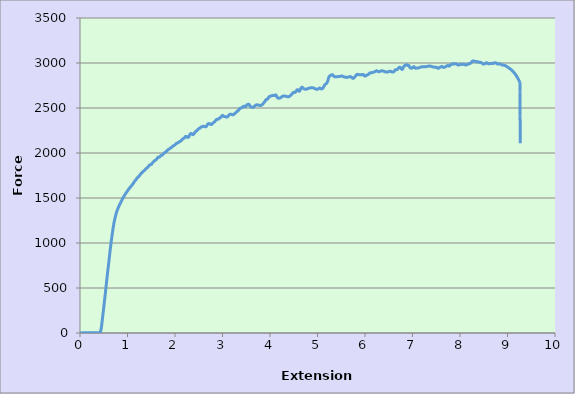
| Category | Series 0 |
|---|---|
| 0.0 | 1.5 |
| 0.0 | 1.5 |
| 0.0 | 1.5 |
| 0.0002 | 1.5 |
| 0.002 | 1.5 |
| 0.0034 | 1.5 |
| 0.0064 | 1.5 |
| 0.0079 | 1.5 |
| 0.0112 | 1.5 |
| 0.0143 | 1.5 |
| 0.0157 | 1.5 |
| 0.0189 | 1 |
| 0.022 | 1 |
| 0.0237 | 1 |
| 0.0268 | 1 |
| 0.03 | 1 |
| 0.0315 | 1 |
| 0.0348 | 1 |
| 0.0365 | 1 |
| 0.0396 | 1 |
| 0.0426 | 1 |
| 0.0442 | 1 |
| 0.0475 | 1 |
| 0.0508 | 1.5 |
| 0.0523 | 1.5 |
| 0.0555 | 1.5 |
| 0.0585 | 1.5 |
| 0.0601 | 1.5 |
| 0.0633 | 1.5 |
| 0.0665 | 1.5 |
| 0.0681 | 1.5 |
| 0.0712 | 1.5 |
| 0.0728 | 1.5 |
| 0.076 | 1.5 |
| 0.0792 | 1.5 |
| 0.0807 | 1.5 |
| 0.0839 | 1.5 |
| 0.0869 | 1.5 |
| 0.0886 | 2 |
| 0.0919 | 2 |
| 0.0951 | 2 |
| 0.0966 | 2 |
| 0.0997 | 2 |
| 0.1013 | 2 |
| 0.1044 | 2 |
| 0.1077 | 2 |
| 0.1094 | 2 |
| 0.1126 | 2 |
| 0.1156 | 2 |
| 0.1171 | 2 |
| 0.1203 | 2 |
| 0.1236 | 2 |
| 0.1253 | 2 |
| 0.1284 | 2 |
| 0.1315 | 2 |
| 0.1331 | 2 |
| 0.1362 | 2 |
| 0.1379 | 2 |
| 0.1411 | 2 |
| 0.1442 | 2 |
| 0.1457 | 2 |
| 0.1489 | 2 |
| 0.1521 | 2 |
| 0.1538 | 2 |
| 0.1568 | 2 |
| 0.1599 | 2 |
| 0.1614 | 2 |
| 0.1647 | 2 |
| 0.1665 | 2 |
| 0.1697 | 2 |
| 0.1727 | 2 |
| 0.1743 | 2 |
| 0.1775 | 2 |
| 0.1807 | 2 |
| 0.1823 | 2 |
| 0.1855 | 2 |
| 0.1885 | 2 |
| 0.1902 | 2.5 |
| 0.1934 | 2.5 |
| 0.1965 | 2.5 |
| 0.198 | 2.5 |
| 0.2011 | 2.5 |
| 0.2028 | 2.5 |
| 0.206 | 2.5 |
| 0.2093 | 2.5 |
| 0.2108 | 2.5 |
| 0.2139 | 2.5 |
| 0.2171 | 2.5 |
| 0.2186 | 2.5 |
| 0.2219 | 2.5 |
| 0.2251 | 2.5 |
| 0.2268 | 2.5 |
| 0.23 | 2.5 |
| 0.2314 | 2.5 |
| 0.2345 | 2.5 |
| 0.2377 | 2.5 |
| 0.2394 | 2.5 |
| 0.2426 | 2.5 |
| 0.2457 | 2.5 |
| 0.2472 | 2.5 |
| 0.2504 | 2.5 |
| 0.2536 | 2.5 |
| 0.2552 | 2.5 |
| 0.2583 | 2.5 |
| 0.2598 | 2.5 |
| 0.2632 | 2.5 |
| 0.2664 | 2.5 |
| 0.268 | 2.5 |
| 0.2711 | 2.5 |
| 0.2742 | 2.5 |
| 0.2758 | 2.5 |
| 0.279 | 2.5 |
| 0.2822 | 2.5 |
| 0.2838 | 2.5 |
| 0.2869 | 2.5 |
| 0.2885 | 2.5 |
| 0.2918 | 2.5 |
| 0.295 | 2.5 |
| 0.2965 | 2.5 |
| 0.2998 | 2.5 |
| 0.3029 | 2.5 |
| 0.3045 | 2.5 |
| 0.3077 | 2.5 |
| 0.3109 | 2.5 |
| 0.3124 | 2.5 |
| 0.3156 | 2.5 |
| 0.3172 | 2.5 |
| 0.3203 | 2.5 |
| 0.3236 | 2.5 |
| 0.3253 | 2.5 |
| 0.3284 | 2.5 |
| 0.3315 | 2.5 |
| 0.3329 | 2.5 |
| 0.3361 | 2.5 |
| 0.3394 | 2.5 |
| 0.3411 | 2.5 |
| 0.3443 | 2.5 |
| 0.3457 | 2.5 |
| 0.349 | 2.5 |
| 0.3522 | 2.5 |
| 0.3537 | 2.5 |
| 0.357 | 2.5 |
| 0.3601 | 2.5 |
| 0.3617 | 2.5 |
| 0.3649 | 2.9 |
| 0.368 | 2.9 |
| 0.3695 | 2.9 |
| 0.3727 | 2.9 |
| 0.3758 | 2.9 |
| 0.3775 | 2.9 |
| 0.3807 | 2.9 |
| 0.3823 | 2.9 |
| 0.3855 | 2.9 |
| 0.3885 | 2.9 |
| 0.3901 | 2.9 |
| 0.3933 | 2.9 |
| 0.3966 | 2.9 |
| 0.3981 | 2.9 |
| 0.4014 | 2.9 |
| 0.4044 | 3.4 |
| 0.406 | 3.4 |
| 0.4091 | 3.9 |
| 0.4107 | 3.9 |
| 0.4141 | 4.9 |
| 0.4172 | 5.9 |
| 0.4187 | 6.4 |
| 0.4218 | 8.3 |
| 0.4251 | 10.8 |
| 0.4274 | 12.8 |
| 0.4291 | 14.7 |
| 0.4322 | 19.1 |
| 0.4347 | 21.6 |
| 0.4379 | 28.9 |
| 0.4394 | 33.4 |
| 0.4425 | 37.8 |
| 0.4456 | 47.6 |
| 0.4472 | 53 |
| 0.4503 | 64.7 |
| 0.4528 | 71.6 |
| 0.4561 | 85.8 |
| 0.4576 | 92.7 |
| 0.4609 | 107.9 |
| 0.4639 | 122.6 |
| 0.4662 | 131 |
| 0.468 | 138.8 |
| 0.4712 | 154.5 |
| 0.4744 | 169.7 |
| 0.476 | 177.6 |
| 0.479 | 192.3 |
| 0.4824 | 207 |
| 0.4839 | 214.3 |
| 0.4871 | 228.1 |
| 0.4896 | 235.4 |
| 0.4927 | 250.2 |
| 0.4942 | 257.5 |
| 0.4974 | 273.2 |
| 0.5006 | 287.4 |
| 0.5023 | 293.8 |
| 0.5053 | 308.5 |
| 0.5084 | 322.7 |
| 0.51 | 330.6 |
| 0.5133 | 345.8 |
| 0.515 | 353.7 |
| 0.5181 | 369.3 |
| 0.5211 | 384.1 |
| 0.5226 | 391.9 |
| 0.5258 | 407.1 |
| 0.5284 | 414.5 |
| 0.5316 | 430.2 |
| 0.5331 | 438 |
| 0.5361 | 454.2 |
| 0.5393 | 470.4 |
| 0.541 | 478.2 |
| 0.5442 | 494.4 |
| 0.5473 | 510.1 |
| 0.549 | 517.5 |
| 0.5521 | 532.7 |
| 0.5554 | 547.9 |
| 0.5569 | 555.7 |
| 0.5601 | 570.9 |
| 0.5617 | 578.3 |
| 0.5648 | 593 |
| 0.568 | 608.2 |
| 0.5695 | 616.6 |
| 0.5728 | 631.3 |
| 0.576 | 646.5 |
| 0.5776 | 653.8 |
| 0.5807 | 669 |
| 0.5838 | 683.8 |
| 0.5853 | 691.1 |
| 0.5885 | 705.8 |
| 0.591 | 713.7 |
| 0.5941 | 729.9 |
| 0.5958 | 737.7 |
| 0.599 | 752.4 |
| 0.6005 | 760.3 |
| 0.6039 | 775 |
| 0.6069 | 789.7 |
| 0.6084 | 796.6 |
| 0.6117 | 812.3 |
| 0.6149 | 827.5 |
| 0.6166 | 835.3 |
| 0.6197 | 850.5 |
| 0.6227 | 865.7 |
| 0.6243 | 872.6 |
| 0.6275 | 886.8 |
| 0.6308 | 902 |
| 0.6324 | 908.4 |
| 0.6355 | 922.6 |
| 0.637 | 930 |
| 0.6401 | 943.7 |
| 0.6434 | 957.5 |
| 0.6451 | 963.8 |
| 0.6482 | 977.1 |
| 0.6513 | 990.8 |
| 0.6528 | 997.7 |
| 0.6561 | 1010.9 |
| 0.6592 | 1023.7 |
| 0.6609 | 1029.6 |
| 0.664 | 1042.8 |
| 0.6655 | 1048.7 |
| 0.6689 | 1061 |
| 0.6721 | 1073.7 |
| 0.6736 | 1080.1 |
| 0.6767 | 1091.9 |
| 0.6797 | 1104.1 |
| 0.6814 | 1109.5 |
| 0.6847 | 1120.8 |
| 0.688 | 1132.6 |
| 0.6894 | 1138.5 |
| 0.6926 | 1149.2 |
| 0.6941 | 1155.1 |
| 0.6973 | 1166.4 |
| 0.7005 | 1176.7 |
| 0.7023 | 1181.6 |
| 0.7055 | 1191.9 |
| 0.7085 | 1201.7 |
| 0.71 | 1207.1 |
| 0.7132 | 1216.4 |
| 0.7164 | 1225.8 |
| 0.718 | 1230.2 |
| 0.7212 | 1238.5 |
| 0.7226 | 1243.4 |
| 0.726 | 1251.8 |
| 0.7292 | 1259.6 |
| 0.7308 | 1263.5 |
| 0.7339 | 1267.5 |
| 0.7369 | 1275.8 |
| 0.7386 | 1279.2 |
| 0.7418 | 1287.1 |
| 0.7451 | 1293.9 |
| 0.7466 | 1297.4 |
| 0.7498 | 1304.2 |
| 0.7528 | 1310.6 |
| 0.7545 | 1314 |
| 0.7576 | 1319.9 |
| 0.7592 | 1323.4 |
| 0.7624 | 1328.8 |
| 0.7655 | 1334.2 |
| 0.7672 | 1337.1 |
| 0.7703 | 1342.5 |
| 0.7736 | 1347.4 |
| 0.7751 | 1349.9 |
| 0.7782 | 1354.8 |
| 0.7813 | 1359.2 |
| 0.783 | 1361.6 |
| 0.7863 | 1366 |
| 0.788 | 1368.5 |
| 0.7912 | 1372.4 |
| 0.7942 | 1377.3 |
| 0.7956 | 1379.3 |
| 0.7988 | 1383.2 |
| 0.802 | 1387.1 |
| 0.8037 | 1389.6 |
| 0.8069 | 1393.5 |
| 0.81 | 1397.4 |
| 0.8114 | 1398.9 |
| 0.8146 | 1402.8 |
| 0.8163 | 1404.8 |
| 0.8196 | 1408.7 |
| 0.8227 | 1412.6 |
| 0.8243 | 1414.1 |
| 0.8275 | 1418 |
| 0.8308 | 1422 |
| 0.8323 | 1423.9 |
| 0.8355 | 1427.4 |
| 0.8387 | 1430.8 |
| 0.8402 | 1432.8 |
| 0.8434 | 1436.7 |
| 0.8451 | 1438.1 |
| 0.8483 | 1441.6 |
| 0.8514 | 1445 |
| 0.853 | 1447 |
| 0.8561 | 1450.4 |
| 0.8594 | 1453.8 |
| 0.861 | 1455.8 |
| 0.8641 | 1459.2 |
| 0.8672 | 1462.2 |
| 0.8688 | 1464.1 |
| 0.872 | 1467.1 |
| 0.8735 | 1469 |
| 0.8769 | 1472 |
| 0.8801 | 1475.4 |
| 0.8816 | 1476.9 |
| 0.8847 | 1480.3 |
| 0.8878 | 1483.3 |
| 0.8895 | 1484.7 |
| 0.8927 | 1488.2 |
| 0.8958 | 1491.1 |
| 0.8973 | 1493.1 |
| 0.9005 | 1496 |
| 0.9022 | 1497.5 |
| 0.9055 | 1500.4 |
| 0.9086 | 1503.4 |
| 0.9101 | 1505.3 |
| 0.9133 | 1508.3 |
| 0.9166 | 1511.2 |
| 0.9181 | 1512.7 |
| 0.9214 | 1515.2 |
| 0.9245 | 1518.1 |
| 0.926 | 1519.6 |
| 0.9291 | 1522.5 |
| 0.9307 | 1524 |
| 0.934 | 1526.9 |
| 0.9372 | 1529.4 |
| 0.9387 | 1530.9 |
| 0.9418 | 1533.3 |
| 0.945 | 1535.8 |
| 0.9467 | 1537.2 |
| 0.9499 | 1540.2 |
| 0.953 | 1542.6 |
| 0.9544 | 1543.6 |
| 0.9576 | 1546.5 |
| 0.9594 | 1547.5 |
| 0.9626 | 1550.5 |
| 0.9658 | 1552.9 |
| 0.9674 | 1554.4 |
| 0.9704 | 1556.8 |
| 0.9736 | 1559.3 |
| 0.9754 | 1560.3 |
| 0.9786 | 1562.7 |
| 0.9817 | 1565.2 |
| 0.9832 | 1566.7 |
| 0.9863 | 1568.6 |
| 0.988 | 1570.1 |
| 0.9912 | 1572.5 |
| 0.9944 | 1574.5 |
| 0.9961 | 1576 |
| 0.9992 | 1578.4 |
| 1.0024 | 1580.9 |
| 1.0039 | 1582.4 |
| 1.0071 | 1584.8 |
| 1.0102 | 1586.8 |
| 1.0118 | 1588.2 |
| 1.015 | 1590.7 |
| 1.0165 | 1591.7 |
| 1.0199 | 1594.1 |
| 1.0231 | 1596.6 |
| 1.0245 | 1598 |
| 1.0275 | 1600 |
| 1.0308 | 1602.5 |
| 1.0325 | 1603.4 |
| 1.0358 | 1605.9 |
| 1.039 | 1607.9 |
| 1.0404 | 1608.8 |
| 1.0435 | 1610.8 |
| 1.0451 | 1611.8 |
| 1.0484 | 1613.7 |
| 1.0516 | 1615.7 |
| 1.0533 | 1616.7 |
| 1.0564 | 1618.6 |
| 1.0595 | 1620.6 |
| 1.061 | 1621.6 |
| 1.0642 | 1623.6 |
| 1.0674 | 1626 |
| 1.069 | 1627 |
| 1.0722 | 1629 |
| 1.0737 | 1629.9 |
| 1.0771 | 1632.4 |
| 1.0803 | 1634.3 |
| 1.0817 | 1635.3 |
| 1.0848 | 1637.3 |
| 1.088 | 1639.7 |
| 1.0897 | 1640.7 |
| 1.093 | 1642.7 |
| 1.0962 | 1644.6 |
| 1.0978 | 1645.6 |
| 1.1008 | 1647.6 |
| 1.1023 | 1648.6 |
| 1.1055 | 1651 |
| 1.1089 | 1653 |
| 1.1105 | 1654 |
| 1.1135 | 1656.4 |
| 1.1167 | 1658.9 |
| 1.1184 | 1659.9 |
| 1.1216 | 1662.3 |
| 1.1247 | 1665.2 |
| 1.1262 | 1666.2 |
| 1.1293 | 1669.2 |
| 1.131 | 1670.6 |
| 1.1343 | 1673.1 |
| 1.1375 | 1676 |
| 1.1391 | 1677.5 |
| 1.1422 | 1680 |
| 1.1453 | 1682.4 |
| 1.1468 | 1683.4 |
| 1.1501 | 1685.8 |
| 1.1533 | 1687.8 |
| 1.1549 | 1688.8 |
| 1.1579 | 1690.8 |
| 1.1594 | 1692.2 |
| 1.1628 | 1694.2 |
| 1.1661 | 1696.1 |
| 1.1678 | 1697.1 |
| 1.1709 | 1699.1 |
| 1.174 | 1701.5 |
| 1.1756 | 1702.5 |
| 1.1787 | 1704.5 |
| 1.1819 | 1706.9 |
| 1.1836 | 1707.9 |
| 1.1867 | 1709.9 |
| 1.1882 | 1710.9 |
| 1.1914 | 1713.3 |
| 1.1946 | 1715.3 |
| 1.1962 | 1716.8 |
| 1.1993 | 1718.7 |
| 1.2024 | 1721.2 |
| 1.204 | 1722.1 |
| 1.2073 | 1724.1 |
| 1.2105 | 1726.1 |
| 1.2121 | 1727.1 |
| 1.2151 | 1729 |
| 1.2166 | 1730 |
| 1.22 | 1732 |
| 1.2232 | 1733.4 |
| 1.2248 | 1733.9 |
| 1.228 | 1735.4 |
| 1.231 | 1736.9 |
| 1.2327 | 1737.8 |
| 1.2358 | 1739.3 |
| 1.239 | 1740.8 |
| 1.2407 | 1741.8 |
| 1.2438 | 1743.2 |
| 1.2453 | 1744.2 |
| 1.2487 | 1746.2 |
| 1.252 | 1748.6 |
| 1.2535 | 1749.6 |
| 1.2565 | 1752.1 |
| 1.2596 | 1754.5 |
| 1.2613 | 1755.5 |
| 1.2646 | 1757 |
| 1.2678 | 1759.4 |
| 1.2693 | 1760.9 |
| 1.2724 | 1763.3 |
| 1.274 | 1764.8 |
| 1.2771 | 1766.8 |
| 1.2803 | 1769.2 |
| 1.282 | 1770.2 |
| 1.2852 | 1772.2 |
| 1.2883 | 1773.6 |
| 1.2898 | 1774.6 |
| 1.293 | 1775.6 |
| 1.2962 | 1777.1 |
| 1.2979 | 1777.6 |
| 1.301 | 1779 |
| 1.3042 | 1780.5 |
| 1.3059 | 1781 |
| 1.3091 | 1783 |
| 1.3107 | 1783.5 |
| 1.3137 | 1785.4 |
| 1.3168 | 1787.4 |
| 1.3184 | 1788.4 |
| 1.3217 | 1790.8 |
| 1.3249 | 1792.8 |
| 1.3265 | 1793.8 |
| 1.3295 | 1795.7 |
| 1.3326 | 1797.7 |
| 1.3343 | 1798.2 |
| 1.3375 | 1799.6 |
| 1.3391 | 1800.1 |
| 1.3423 | 1801.1 |
| 1.3453 | 1802.1 |
| 1.347 | 1802.6 |
| 1.3502 | 1803.6 |
| 1.3534 | 1804.5 |
| 1.3549 | 1805 |
| 1.3581 | 1806.5 |
| 1.3611 | 1808.5 |
| 1.3628 | 1809 |
| 1.3661 | 1810.9 |
| 1.3676 | 1811.9 |
| 1.3709 | 1813.9 |
| 1.3739 | 1815.8 |
| 1.3754 | 1816.8 |
| 1.3786 | 1818.8 |
| 1.3819 | 1820.7 |
| 1.3836 | 1821.7 |
| 1.3868 | 1823.2 |
| 1.3898 | 1825.2 |
| 1.3913 | 1825.6 |
| 1.3945 | 1827.1 |
| 1.3962 | 1828.1 |
| 1.3995 | 1829.6 |
| 1.4026 | 1831 |
| 1.4042 | 1831.5 |
| 1.4074 | 1833 |
| 1.4105 | 1834.5 |
| 1.412 | 1835.5 |
| 1.4152 | 1836.9 |
| 1.4183 | 1838.4 |
| 1.42 | 1838.9 |
| 1.4232 | 1840.4 |
| 1.4265 | 1842.3 |
| 1.4281 | 1842.8 |
| 1.4311 | 1844.8 |
| 1.4326 | 1845.8 |
| 1.4358 | 1847.7 |
| 1.4391 | 1849.7 |
| 1.4408 | 1851.1 |
| 1.444 | 1853.6 |
| 1.447 | 1856.1 |
| 1.4485 | 1857 |
| 1.4516 | 1859.5 |
| 1.4549 | 1861.9 |
| 1.4566 | 1862.9 |
| 1.4597 | 1864.4 |
| 1.4611 | 1865.4 |
| 1.4644 | 1866.8 |
| 1.4676 | 1867.8 |
| 1.4692 | 1867.8 |
| 1.4724 | 1868.8 |
| 1.4755 | 1869.3 |
| 1.477 | 1869.3 |
| 1.4802 | 1869.3 |
| 1.4835 | 1869.3 |
| 1.4852 | 1869.3 |
| 1.4882 | 1869.8 |
| 1.4897 | 1869.8 |
| 1.493 | 1870.3 |
| 1.4962 | 1871.3 |
| 1.4977 | 1871.7 |
| 1.5009 | 1872.7 |
| 1.5041 | 1874.7 |
| 1.5056 | 1875.2 |
| 1.5087 | 1877.1 |
| 1.512 | 1879.6 |
| 1.5137 | 1880.6 |
| 1.5169 | 1883.5 |
| 1.5183 | 1884.5 |
| 1.5217 | 1887 |
| 1.5249 | 1889.9 |
| 1.5264 | 1890.9 |
| 1.5296 | 1893.3 |
| 1.5327 | 1895.3 |
| 1.5343 | 1896.3 |
| 1.5376 | 1897.7 |
| 1.5408 | 1899.7 |
| 1.5423 | 1900.2 |
| 1.5454 | 1901.7 |
| 1.5469 | 1902.2 |
| 1.5501 | 1903.6 |
| 1.5534 | 1905.1 |
| 1.5551 | 1905.6 |
| 1.5583 | 1907.1 |
| 1.5614 | 1909 |
| 1.5628 | 1909.5 |
| 1.566 | 1911.5 |
| 1.5692 | 1913 |
| 1.5709 | 1913.9 |
| 1.5741 | 1915.4 |
| 1.5756 | 1915.9 |
| 1.5789 | 1917.4 |
| 1.582 | 1918.3 |
| 1.5835 | 1919.3 |
| 1.5867 | 1920.3 |
| 1.5898 | 1921.3 |
| 1.5914 | 1921.8 |
| 1.5947 | 1922.8 |
| 1.5979 | 1923.7 |
| 1.5995 | 1924.2 |
| 1.6027 | 1925.7 |
| 1.6042 | 1926.7 |
| 1.6073 | 1928.2 |
| 1.6106 | 1929.6 |
| 1.6123 | 1930.6 |
| 1.6155 | 1932.6 |
| 1.6186 | 1935 |
| 1.6201 | 1936.5 |
| 1.6232 | 1938.9 |
| 1.6264 | 1941.4 |
| 1.628 | 1942.9 |
| 1.6312 | 1945.3 |
| 1.6329 | 1946.3 |
| 1.636 | 1948.8 |
| 1.6392 | 1950.2 |
| 1.6409 | 1951.2 |
| 1.6441 | 1952.7 |
| 1.6472 | 1953.2 |
| 1.6486 | 1953.7 |
| 1.6518 | 1953.7 |
| 1.6551 | 1953.7 |
| 1.6568 | 1953.7 |
| 1.66 | 1953.7 |
| 1.6614 | 1953.7 |
| 1.6646 | 1953.7 |
| 1.6678 | 1953.7 |
| 1.6694 | 1954.2 |
| 1.6726 | 1955.1 |
| 1.6758 | 1956.1 |
| 1.6774 | 1956.6 |
| 1.6805 | 1958.1 |
| 1.6836 | 1960 |
| 1.6852 | 1961 |
| 1.6884 | 1963 |
| 1.6915 | 1965.4 |
| 1.6932 | 1966.4 |
| 1.6964 | 1968.4 |
| 1.6979 | 1968.9 |
| 1.7011 | 1970.3 |
| 1.7042 | 1971.8 |
| 1.7059 | 1972.3 |
| 1.709 | 1973.3 |
| 1.7123 | 1973.8 |
| 1.7138 | 1974.3 |
| 1.7169 | 1974.8 |
| 1.72 | 1975.2 |
| 1.7216 | 1975.2 |
| 1.7248 | 1975.7 |
| 1.7264 | 1976.2 |
| 1.7298 | 1976.7 |
| 1.733 | 1977.7 |
| 1.7344 | 1978.2 |
| 1.7375 | 1979.7 |
| 1.7407 | 1981.1 |
| 1.7424 | 1982.1 |
| 1.7456 | 1984.1 |
| 1.7487 | 1986 |
| 1.7504 | 1987 |
| 1.7535 | 1989 |
| 1.755 | 1990 |
| 1.7582 | 1991.9 |
| 1.7614 | 1993.9 |
| 1.763 | 1994.9 |
| 1.7661 | 1996.3 |
| 1.7694 | 1998.3 |
| 1.7709 | 1998.8 |
| 1.7741 | 2000.3 |
| 1.7772 | 2001.7 |
| 1.7788 | 2002.2 |
| 1.7819 | 2003.7 |
| 1.7835 | 2004.2 |
| 1.7869 | 2005.2 |
| 1.7902 | 2006.6 |
| 1.7916 | 2007.1 |
| 1.7947 | 2008.1 |
| 1.7978 | 2009.1 |
| 1.7994 | 2010.1 |
| 1.8027 | 2011 |
| 1.8059 | 2012 |
| 1.8073 | 2013 |
| 1.8107 | 2014 |
| 1.8122 | 2014.5 |
| 1.8156 | 2016 |
| 1.8187 | 2017.4 |
| 1.8202 | 2018.4 |
| 1.8233 | 2019.9 |
| 1.8265 | 2021.8 |
| 1.8283 | 2022.3 |
| 1.8315 | 2024.3 |
| 1.8346 | 2026.3 |
| 1.836 | 2027.2 |
| 1.8391 | 2029.2 |
| 1.8408 | 2030.2 |
| 1.8441 | 2032.1 |
| 1.8473 | 2034.1 |
| 1.8489 | 2034.6 |
| 1.8519 | 2036.1 |
| 1.8551 | 2037.5 |
| 1.8566 | 2038 |
| 1.8599 | 2039.5 |
| 1.8631 | 2040 |
| 1.8647 | 2040.5 |
| 1.8678 | 2041.5 |
| 1.8694 | 2042 |
| 1.8727 | 2042.4 |
| 1.8759 | 2043.4 |
| 1.8774 | 2043.9 |
| 1.8805 | 2044.9 |
| 1.8837 | 2045.9 |
| 1.8854 | 2046.9 |
| 1.8886 | 2047.8 |
| 1.8917 | 2049.3 |
| 1.8932 | 2050.3 |
| 1.8962 | 2051.8 |
| 1.898 | 2052.3 |
| 1.9012 | 2053.7 |
| 1.9045 | 2055.2 |
| 1.9061 | 2055.7 |
| 1.9092 | 2057.2 |
| 1.9123 | 2058.1 |
| 1.9138 | 2058.6 |
| 1.917 | 2060.1 |
| 1.9203 | 2061.1 |
| 1.9219 | 2061.1 |
| 1.925 | 2062.6 |
| 1.9265 | 2063 |
| 1.9298 | 2064 |
| 1.933 | 2065.5 |
| 1.9345 | 2066 |
| 1.9376 | 2067.5 |
| 1.9408 | 2068.9 |
| 1.9425 | 2069.4 |
| 1.9458 | 2071.4 |
| 1.949 | 2072.9 |
| 1.9504 | 2073.3 |
| 1.9534 | 2074.8 |
| 1.9551 | 2075.8 |
| 1.9586 | 2077.3 |
| 1.9618 | 2078.2 |
| 1.9633 | 2079.2 |
| 1.9664 | 2080.2 |
| 1.9695 | 2081.2 |
| 1.9711 | 2081.7 |
| 1.9743 | 2082.7 |
| 1.9776 | 2083.6 |
| 1.9791 | 2084.1 |
| 1.9822 | 2085.1 |
| 1.9838 | 2085.6 |
| 1.987 | 2086.6 |
| 1.9902 | 2087.6 |
| 1.9919 | 2088.1 |
| 1.995 | 2089.5 |
| 1.9981 | 2090.5 |
| 1.9997 | 2091.5 |
| 2.003 | 2093 |
| 2.0061 | 2094.4 |
| 2.0077 | 2095.4 |
| 2.0108 | 2097.4 |
| 2.0123 | 2097.9 |
| 2.0157 | 2099.8 |
| 2.0189 | 2101.8 |
| 2.0204 | 2102.8 |
| 2.0235 | 2104.2 |
| 2.0266 | 2105.7 |
| 2.0283 | 2106.2 |
| 2.0315 | 2107.2 |
| 2.0348 | 2108.2 |
| 2.0363 | 2108.7 |
| 2.0393 | 2109.2 |
| 2.041 | 2109.2 |
| 2.0442 | 2109.6 |
| 2.0474 | 2110.1 |
| 2.0491 | 2110.1 |
| 2.0522 | 2110.6 |
| 2.0553 | 2111.1 |
| 2.0568 | 2111.6 |
| 2.0601 | 2112.6 |
| 2.0632 | 2114.1 |
| 2.0649 | 2114.5 |
| 2.0679 | 2116 |
| 2.0694 | 2116.5 |
| 2.0728 | 2118 |
| 2.0761 | 2119.5 |
| 2.0776 | 2119.9 |
| 2.0808 | 2121.4 |
| 2.084 | 2122.4 |
| 2.0855 | 2122.9 |
| 2.0887 | 2123.4 |
| 2.0919 | 2124.4 |
| 2.0936 | 2124.4 |
| 2.0967 | 2125.3 |
| 2.0982 | 2125.3 |
| 2.1014 | 2126.3 |
| 2.1045 | 2127.3 |
| 2.1062 | 2127.8 |
| 2.1093 | 2129.3 |
| 2.1124 | 2130.2 |
| 2.1141 | 2131.2 |
| 2.1174 | 2132.7 |
| 2.1206 | 2134.2 |
| 2.1221 | 2134.7 |
| 2.1251 | 2136.6 |
| 2.1283 | 2138.1 |
| 2.13 | 2138.6 |
| 2.1333 | 2140.1 |
| 2.1348 | 2141 |
| 2.138 | 2142 |
| 2.141 | 2144 |
| 2.1426 | 2144.5 |
| 2.1458 | 2146.4 |
| 2.149 | 2147.9 |
| 2.1506 | 2148.9 |
| 2.1537 | 2150.8 |
| 2.1568 | 2153.3 |
| 2.1585 | 2154.3 |
| 2.1617 | 2156.2 |
| 2.1645 | 2157.2 |
| 2.1661 | 2157.7 |
| 2.1692 | 2159.2 |
| 2.1724 | 2160.7 |
| 2.1741 | 2161.1 |
| 2.1773 | 2161.6 |
| 2.1805 | 2162.1 |
| 2.1819 | 2162.6 |
| 2.185 | 2163.1 |
| 2.1866 | 2163.6 |
| 2.1899 | 2164.6 |
| 2.1931 | 2165.6 |
| 2.1946 | 2166 |
| 2.1978 | 2167.5 |
| 2.2009 | 2169.5 |
| 2.2024 | 2170.5 |
| 2.2057 | 2172.4 |
| 2.2089 | 2174.9 |
| 2.2106 | 2175.9 |
| 2.2137 | 2178.3 |
| 2.2152 | 2179.3 |
| 2.2186 | 2181.3 |
| 2.2217 | 2182.7 |
| 2.2233 | 2183.2 |
| 2.2264 | 2184.2 |
| 2.2295 | 2184.7 |
| 2.2312 | 2184.7 |
| 2.2344 | 2184.2 |
| 2.2376 | 2183.7 |
| 2.2391 | 2183.2 |
| 2.2421 | 2182.7 |
| 2.2437 | 2181.7 |
| 2.247 | 2180.8 |
| 2.2503 | 2179.3 |
| 2.252 | 2178.8 |
| 2.2551 | 2177.3 |
| 2.2581 | 2176.3 |
| 2.2596 | 2175.4 |
| 2.2628 | 2174.4 |
| 2.2661 | 2173.9 |
| 2.2678 | 2173.4 |
| 2.2709 | 2172.9 |
| 2.2723 | 2172.9 |
| 2.2757 | 2172.9 |
| 2.2789 | 2173.9 |
| 2.2803 | 2174.4 |
| 2.2835 | 2175.9 |
| 2.2866 | 2177.8 |
| 2.2883 | 2178.8 |
| 2.2916 | 2181.7 |
| 2.2948 | 2184.7 |
| 2.2963 | 2186.6 |
| 2.2993 | 2190.1 |
| 2.3009 | 2192 |
| 2.3042 | 2196 |
| 2.3075 | 2199.4 |
| 2.3092 | 2201.4 |
| 2.3124 | 2204.3 |
| 2.3154 | 2207.2 |
| 2.317 | 2208.7 |
| 2.3202 | 2211.2 |
| 2.3234 | 2212.6 |
| 2.3249 | 2213.6 |
| 2.328 | 2214.6 |
| 2.3297 | 2215.1 |
| 2.3328 | 2215.6 |
| 2.336 | 2216.1 |
| 2.3377 | 2216.1 |
| 2.3409 | 2215.6 |
| 2.344 | 2215.6 |
| 2.3455 | 2215.1 |
| 2.3487 | 2214.6 |
| 2.352 | 2213.6 |
| 2.3536 | 2213.1 |
| 2.3567 | 2211.7 |
| 2.3581 | 2211.2 |
| 2.3615 | 2209.7 |
| 2.3647 | 2208.2 |
| 2.3662 | 2207.2 |
| 2.3694 | 2205.8 |
| 2.3725 | 2204.8 |
| 2.3741 | 2204.8 |
| 2.3773 | 2203.8 |
| 2.3806 | 2203.8 |
| 2.3821 | 2204.3 |
| 2.3852 | 2204.8 |
| 2.3869 | 2205.8 |
| 2.3901 | 2207.2 |
| 2.3933 | 2209.2 |
| 2.3949 | 2210.7 |
| 2.3981 | 2213.1 |
| 2.4012 | 2215.6 |
| 2.4027 | 2217.1 |
| 2.4059 | 2219.5 |
| 2.4091 | 2222 |
| 2.4108 | 2223.4 |
| 2.4138 | 2225.4 |
| 2.4152 | 2226.9 |
| 2.4186 | 2228.8 |
| 2.4219 | 2230.3 |
| 2.4234 | 2231.3 |
| 2.4266 | 2233.2 |
| 2.4297 | 2234.7 |
| 2.4313 | 2235.7 |
| 2.4345 | 2237.2 |
| 2.4377 | 2238.6 |
| 2.4393 | 2239.6 |
| 2.4425 | 2241.1 |
| 2.444 | 2242.1 |
| 2.4472 | 2243.5 |
| 2.4503 | 2245 |
| 2.452 | 2245.5 |
| 2.4552 | 2247 |
| 2.4583 | 2248 |
| 2.4598 | 2248.9 |
| 2.463 | 2250.4 |
| 2.4664 | 2251.9 |
| 2.468 | 2252.9 |
| 2.471 | 2254.3 |
| 2.4726 | 2255.3 |
| 2.4758 | 2257.3 |
| 2.479 | 2259.2 |
| 2.4808 | 2260.2 |
| 2.484 | 2262.2 |
| 2.4871 | 2264.1 |
| 2.4885 | 2265.1 |
| 2.4916 | 2266.6 |
| 2.4948 | 2268.1 |
| 2.4965 | 2268.6 |
| 2.4997 | 2270 |
| 2.5012 | 2270 |
| 2.5045 | 2271 |
| 2.5077 | 2272 |
| 2.5092 | 2272 |
| 2.5124 | 2273 |
| 2.5155 | 2274 |
| 2.5172 | 2274.4 |
| 2.5204 | 2275.4 |
| 2.5236 | 2276.9 |
| 2.5252 | 2277.4 |
| 2.5283 | 2279.4 |
| 2.5313 | 2280.8 |
| 2.533 | 2281.8 |
| 2.5362 | 2283.8 |
| 2.5377 | 2284.3 |
| 2.5409 | 2285.7 |
| 2.5441 | 2287.2 |
| 2.5456 | 2287.7 |
| 2.5487 | 2288.7 |
| 2.552 | 2289.2 |
| 2.5535 | 2289.2 |
| 2.5568 | 2289.7 |
| 2.5599 | 2290.1 |
| 2.5615 | 2290.1 |
| 2.5647 | 2290.6 |
| 2.5664 | 2290.6 |
| 2.5696 | 2291.1 |
| 2.5727 | 2292.1 |
| 2.5742 | 2292.1 |
| 2.5774 | 2293.1 |
| 2.5806 | 2294.1 |
| 2.5823 | 2294.6 |
| 2.5854 | 2295 |
| 2.5884 | 2296 |
| 2.5899 | 2296 |
| 2.5932 | 2296.5 |
| 2.5965 | 2297 |
| 2.5982 | 2297 |
| 2.6013 | 2297 |
| 2.6027 | 2297 |
| 2.6058 | 2296.5 |
| 2.609 | 2296.5 |
| 2.6107 | 2296 |
| 2.614 | 2295.5 |
| 2.6171 | 2295 |
| 2.6185 | 2294.6 |
| 2.6217 | 2293.6 |
| 2.6249 | 2293.1 |
| 2.6265 | 2292.6 |
| 2.6297 | 2292.1 |
| 2.6311 | 2291.6 |
| 2.6344 | 2291.1 |
| 2.6377 | 2290.6 |
| 2.6393 | 2290.6 |
| 2.6425 | 2290.6 |
| 2.6455 | 2290.6 |
| 2.6471 | 2291.1 |
| 2.6503 | 2291.6 |
| 2.6536 | 2292.6 |
| 2.6551 | 2293.1 |
| 2.6584 | 2295 |
| 2.66 | 2296 |
| 2.663 | 2298 |
| 2.6661 | 2300.4 |
| 2.6678 | 2301.9 |
| 2.6711 | 2304.4 |
| 2.6742 | 2307.3 |
| 2.6757 | 2308.8 |
| 2.6788 | 2311.7 |
| 2.682 | 2314.7 |
| 2.6837 | 2316.1 |
| 2.6869 | 2318.6 |
| 2.6883 | 2319.6 |
| 2.6916 | 2321.5 |
| 2.6949 | 2323 |
| 2.6966 | 2324 |
| 2.6998 | 2325 |
| 2.7029 | 2326 |
| 2.7043 | 2326.4 |
| 2.7074 | 2326.9 |
| 2.7107 | 2327.4 |
| 2.7124 | 2327.4 |
| 2.7156 | 2327.4 |
| 2.7171 | 2327.4 |
| 2.7201 | 2326.9 |
| 2.7233 | 2326.4 |
| 2.725 | 2326.4 |
| 2.7283 | 2325.5 |
| 2.7315 | 2324.5 |
| 2.7329 | 2324 |
| 2.7362 | 2323 |
| 2.7394 | 2321.5 |
| 2.7409 | 2321 |
| 2.7441 | 2320.1 |
| 2.7458 | 2319.1 |
| 2.7489 | 2318.1 |
| 2.752 | 2317.1 |
| 2.7537 | 2316.6 |
| 2.7569 | 2315.7 |
| 2.76 | 2315.7 |
| 2.7615 | 2315.7 |
| 2.7645 | 2315.7 |
| 2.7678 | 2316.6 |
| 2.7695 | 2317.1 |
| 2.7728 | 2318.1 |
| 2.7743 | 2319.1 |
| 2.7775 | 2320.6 |
| 2.7806 | 2322.5 |
| 2.7822 | 2323.5 |
| 2.7854 | 2325 |
| 2.7886 | 2326.9 |
| 2.7903 | 2327.9 |
| 2.7933 | 2329.9 |
| 2.7965 | 2331.8 |
| 2.798 | 2332.3 |
| 2.8012 | 2334.3 |
| 2.8028 | 2334.8 |
| 2.806 | 2336.3 |
| 2.8092 | 2337.7 |
| 2.8109 | 2338.7 |
| 2.8141 | 2339.7 |
| 2.8173 | 2340.7 |
| 2.8187 | 2341.2 |
| 2.8217 | 2342.6 |
| 2.825 | 2343.6 |
| 2.8267 | 2344.1 |
| 2.83 | 2345.1 |
| 2.8315 | 2346.1 |
| 2.8347 | 2347 |
| 2.8378 | 2349 |
| 2.8394 | 2350 |
| 2.8427 | 2351.9 |
| 2.8459 | 2353.9 |
| 2.8474 | 2355.4 |
| 2.8505 | 2357.8 |
| 2.8537 | 2360.3 |
| 2.8554 | 2361.3 |
| 2.8586 | 2363.7 |
| 2.8601 | 2364.7 |
| 2.8633 | 2367.2 |
| 2.8665 | 2369.1 |
| 2.8681 | 2369.6 |
| 2.8713 | 2371.1 |
| 2.8745 | 2372.5 |
| 2.8761 | 2373 |
| 2.8791 | 2373.5 |
| 2.8823 | 2374 |
| 2.8839 | 2374.5 |
| 2.8871 | 2374.5 |
| 2.8887 | 2374.5 |
| 2.8918 | 2375 |
| 2.8949 | 2375 |
| 2.8966 | 2375 |
| 2.8998 | 2375 |
| 2.9031 | 2375.5 |
| 2.9046 | 2375.5 |
| 2.9077 | 2376 |
| 2.9109 | 2376.5 |
| 2.9126 | 2377 |
| 2.9158 | 2377.5 |
| 2.9189 | 2378.4 |
| 2.9204 | 2378.9 |
| 2.9235 | 2380.4 |
| 2.9252 | 2381.4 |
| 2.9284 | 2382.8 |
| 2.9316 | 2384.3 |
| 2.9331 | 2385.3 |
| 2.9361 | 2387.3 |
| 2.9393 | 2388.7 |
| 2.941 | 2389.2 |
| 2.9443 | 2390.7 |
| 2.9475 | 2392.2 |
| 2.949 | 2392.7 |
| 2.952 | 2393.6 |
| 2.9536 | 2394.1 |
| 2.9569 | 2395.1 |
| 2.9601 | 2396.1 |
| 2.9618 | 2396.6 |
| 2.9649 | 2398.1 |
| 2.968 | 2399.5 |
| 2.9695 | 2400 |
| 2.9727 | 2402 |
| 2.9759 | 2404.4 |
| 2.9775 | 2405.4 |
| 2.9806 | 2407.9 |
| 2.9821 | 2408.8 |
| 2.9856 | 2411.3 |
| 2.9888 | 2413.3 |
| 2.9903 | 2414.2 |
| 2.9933 | 2415.7 |
| 2.9965 | 2416.7 |
| 2.9982 | 2416.7 |
| 3.0015 | 2416.7 |
| 3.0047 | 2416.2 |
| 3.0062 | 2415.7 |
| 3.0092 | 2414.7 |
| 3.0108 | 2414.2 |
| 3.014 | 2412.8 |
| 3.0172 | 2411.3 |
| 3.0189 | 2410.8 |
| 3.022 | 2409.3 |
| 3.0251 | 2408.4 |
| 3.0268 | 2407.9 |
| 3.03 | 2406.9 |
| 3.0332 | 2406.4 |
| 3.0347 | 2406.4 |
| 3.0378 | 2405.9 |
| 3.0395 | 2405.9 |
| 3.0427 | 2405.4 |
| 3.046 | 2405.4 |
| 3.0476 | 2404.9 |
| 3.0507 | 2404.9 |
| 3.0537 | 2404.4 |
| 3.0553 | 2404.4 |
| 3.0585 | 2403.5 |
| 3.0618 | 2403 |
| 3.0634 | 2402.5 |
| 3.0665 | 2402 |
| 3.068 | 2401.5 |
| 3.0713 | 2401 |
| 3.0745 | 2400.5 |
| 3.0761 | 2400 |
| 3.0792 | 2399.5 |
| 3.0823 | 2399 |
| 3.084 | 2399 |
| 3.0873 | 2399 |
| 3.0904 | 2399 |
| 3.0919 | 2399 |
| 3.095 | 2399.5 |
| 3.0967 | 2399.5 |
| 3.0999 | 2400.5 |
| 3.1031 | 2401.5 |
| 3.1048 | 2402 |
| 3.1078 | 2403 |
| 3.1109 | 2404.4 |
| 3.1124 | 2405.4 |
| 3.1157 | 2407.4 |
| 3.119 | 2409.3 |
| 3.1206 | 2410.3 |
| 3.1237 | 2412.3 |
| 3.1251 | 2413.8 |
| 3.1285 | 2415.7 |
| 3.1317 | 2418.2 |
| 3.1333 | 2419.1 |
| 3.1365 | 2421.1 |
| 3.1395 | 2423.1 |
| 3.1412 | 2424.1 |
| 3.1443 | 2425.5 |
| 3.1475 | 2427 |
| 3.149 | 2427.5 |
| 3.1522 | 2428.5 |
| 3.1538 | 2429 |
| 3.157 | 2429.4 |
| 3.1602 | 2429.9 |
| 3.1619 | 2429.9 |
| 3.1651 | 2430.4 |
| 3.1681 | 2430.4 |
| 3.1695 | 2430.4 |
| 3.1728 | 2430.4 |
| 3.1761 | 2430.4 |
| 3.1778 | 2430.4 |
| 3.1809 | 2429.9 |
| 3.1825 | 2429.9 |
| 3.1856 | 2429.9 |
| 3.1888 | 2429.4 |
| 3.1903 | 2429.4 |
| 3.1936 | 2429 |
| 3.1968 | 2428.5 |
| 3.1983 | 2428 |
| 3.2015 | 2427.5 |
| 3.2047 | 2427 |
| 3.2064 | 2426.5 |
| 3.2095 | 2426 |
| 3.2126 | 2425.5 |
| 3.2142 | 2425.5 |
| 3.2175 | 2425 |
| 3.2192 | 2425 |
| 3.2223 | 2424.5 |
| 3.2253 | 2424.5 |
| 3.2268 | 2425 |
| 3.23 | 2425.5 |
| 3.2332 | 2426 |
| 3.2349 | 2426.5 |
| 3.2381 | 2427.5 |
| 3.2411 | 2429 |
| 3.2426 | 2429.9 |
| 3.2458 | 2431.4 |
| 3.2475 | 2432.4 |
| 3.2508 | 2433.9 |
| 3.2539 | 2435.8 |
| 3.2555 | 2436.3 |
| 3.2587 | 2438.3 |
| 3.2619 | 2439.7 |
| 3.2634 | 2440.7 |
| 3.2666 | 2442.2 |
| 3.2697 | 2443.7 |
| 3.2714 | 2444.2 |
| 3.2746 | 2445.6 |
| 3.2761 | 2446.1 |
| 3.2794 | 2447.6 |
| 3.2825 | 2449.1 |
| 3.2839 | 2450 |
| 3.2872 | 2451.5 |
| 3.2904 | 2453 |
| 3.2922 | 2453.5 |
| 3.2953 | 2455.4 |
| 3.2983 | 2456.9 |
| 3.2998 | 2457.9 |
| 3.303 | 2459.9 |
| 3.3047 | 2460.8 |
| 3.3079 | 2462.3 |
| 3.3111 | 2464.3 |
| 3.3127 | 2464.8 |
| 3.3158 | 2466.2 |
| 3.319 | 2467.7 |
| 3.3205 | 2468.7 |
| 3.3237 | 2469.7 |
| 3.3268 | 2471.1 |
| 3.3284 | 2471.6 |
| 3.3317 | 2473.1 |
| 3.3332 | 2474.1 |
| 3.3366 | 2476 |
| 3.3397 | 2478 |
| 3.3411 | 2479 |
| 3.3443 | 2481.4 |
| 3.3476 | 2483.4 |
| 3.3493 | 2484.9 |
| 3.3525 | 2487.3 |
| 3.3556 | 2489.3 |
| 3.357 | 2490.3 |
| 3.3602 | 2492.2 |
| 3.3618 | 2493.2 |
| 3.3651 | 2494.7 |
| 3.3682 | 2495.7 |
| 3.3698 | 2496.2 |
| 3.373 | 2496.6 |
| 3.3762 | 2497.6 |
| 3.3779 | 2497.6 |
| 3.381 | 2498.1 |
| 3.3841 | 2498.6 |
| 3.3856 | 2499.1 |
| 3.3889 | 2499.6 |
| 3.3921 | 2500.1 |
| 3.3938 | 2500.6 |
| 3.3969 | 2501.6 |
| 3.3983 | 2502 |
| 3.4014 | 2503 |
| 3.4047 | 2504 |
| 3.4064 | 2504.5 |
| 3.4096 | 2505.5 |
| 3.4127 | 2506.5 |
| 3.4142 | 2507.4 |
| 3.4173 | 2508.4 |
| 3.4205 | 2509.9 |
| 3.4223 | 2510.4 |
| 3.4254 | 2511.4 |
| 3.4269 | 2512.3 |
| 3.43 | 2513.8 |
| 3.4334 | 2515.3 |
| 3.4349 | 2515.8 |
| 3.4381 | 2517.2 |
| 3.4412 | 2518.7 |
| 3.4428 | 2519.2 |
| 3.446 | 2519.7 |
| 3.4492 | 2520.2 |
| 3.4508 | 2520.2 |
| 3.4539 | 2520.2 |
| 3.4555 | 2519.7 |
| 3.4585 | 2519.2 |
| 3.4618 | 2518.2 |
| 3.4635 | 2517.2 |
| 3.4668 | 2515.8 |
| 3.4699 | 2514.8 |
| 3.4714 | 2514.3 |
| 3.4745 | 2513.3 |
| 3.4777 | 2512.8 |
| 3.4794 | 2512.8 |
| 3.4826 | 2513.3 |
| 3.4841 | 2513.8 |
| 3.4874 | 2514.8 |
| 3.4905 | 2516.8 |
| 3.492 | 2517.7 |
| 3.4952 | 2520.7 |
| 3.4984 | 2523.1 |
| 3.5 | 2524.6 |
| 3.5031 | 2527.5 |
| 3.5064 | 2530 |
| 3.5079 | 2531 |
| 3.5111 | 2532.9 |
| 3.5127 | 2533.9 |
| 3.5158 | 2535.4 |
| 3.519 | 2536.4 |
| 3.5207 | 2536.9 |
| 3.524 | 2537.4 |
| 3.5272 | 2537.8 |
| 3.5286 | 2538.3 |
| 3.5316 | 2538.8 |
| 3.5348 | 2539.8 |
| 3.5365 | 2539.8 |
| 3.5397 | 2540.8 |
| 3.5412 | 2541.3 |
| 3.5445 | 2541.8 |
| 3.5477 | 2541.8 |
| 3.5492 | 2541.8 |
| 3.5524 | 2541.8 |
| 3.5556 | 2540.8 |
| 3.5572 | 2539.8 |
| 3.5603 | 2538.3 |
| 3.5636 | 2535.9 |
| 3.5653 | 2534.4 |
| 3.5685 | 2531.5 |
| 3.57 | 2530 |
| 3.5731 | 2526.6 |
| 3.5763 | 2523.6 |
| 3.5778 | 2522.2 |
| 3.5811 | 2519.7 |
| 3.5843 | 2517.2 |
| 3.5859 | 2516.3 |
| 3.5889 | 2514.8 |
| 3.5921 | 2513.3 |
| 3.5936 | 2512.8 |
| 3.5969 | 2512.3 |
| 3.5986 | 2511.9 |
| 3.6017 | 2511.4 |
| 3.6049 | 2510.9 |
| 3.6066 | 2510.9 |
| 3.6098 | 2510.4 |
| 3.6129 | 2509.9 |
| 3.6144 | 2509.4 |
| 3.6175 | 2508.9 |
| 3.6208 | 2508.4 |
| 3.6224 | 2508.4 |
| 3.6256 | 2507.9 |
| 3.6271 | 2507.9 |
| 3.6303 | 2507.4 |
| 3.6335 | 2507.4 |
| 3.635 | 2507.4 |
| 3.6383 | 2507.4 |
| 3.6415 | 2507.9 |
| 3.6431 | 2507.9 |
| 3.6461 | 2508.4 |
| 3.6493 | 2508.9 |
| 3.6508 | 2509.4 |
| 3.6541 | 2509.9 |
| 3.6573 | 2510.9 |
| 3.6589 | 2511.4 |
| 3.662 | 2512.8 |
| 3.6635 | 2513.3 |
| 3.6667 | 2514.8 |
| 3.6698 | 2516.8 |
| 3.6715 | 2517.2 |
| 3.6746 | 2519.2 |
| 3.6778 | 2521.2 |
| 3.6794 | 2522.2 |
| 3.6826 | 2523.6 |
| 3.6858 | 2525.6 |
| 3.6874 | 2526.6 |
| 3.6904 | 2528 |
| 3.692 | 2528.5 |
| 3.6954 | 2530 |
| 3.6987 | 2531.5 |
| 3.7002 | 2532 |
| 3.7032 | 2532.9 |
| 3.7063 | 2533.4 |
| 3.708 | 2533.9 |
| 3.7112 | 2534.4 |
| 3.7144 | 2534.4 |
| 3.7159 | 2534.9 |
| 3.719 | 2534.9 |
| 3.7207 | 2534.9 |
| 3.7239 | 2534.9 |
| 3.727 | 2534.9 |
| 3.7287 | 2534.9 |
| 3.7318 | 2534.9 |
| 3.735 | 2534.9 |
| 3.7366 | 2534.4 |
| 3.7398 | 2534.4 |
| 3.7429 | 2534.4 |
| 3.7446 | 2533.9 |
| 3.7476 | 2533.9 |
| 3.7508 | 2533.4 |
| 3.7524 | 2533.4 |
| 3.7556 | 2532.9 |
| 3.7573 | 2532.9 |
| 3.7603 | 2532.5 |
| 3.7634 | 2532 |
| 3.765 | 2531.5 |
| 3.7684 | 2531 |
| 3.7716 | 2530.5 |
| 3.7731 | 2530 |
| 3.7762 | 2529.5 |
| 3.7794 | 2529 |
| 3.7811 | 2529 |
| 3.7846 | 2529 |
| 3.7863 | 2528.5 |
| 3.7893 | 2528.5 |
| 3.7908 | 2528.5 |
| 3.794 | 2528.5 |
| 3.7974 | 2528.5 |
| 3.7989 | 2528.5 |
| 3.802 | 2529 |
| 3.805 | 2529 |
| 3.8067 | 2529.5 |
| 3.81 | 2530 |
| 3.8133 | 2530.5 |
| 3.8148 | 2531 |
| 3.8179 | 2531.5 |
| 3.8209 | 2532.5 |
| 3.8226 | 2532.9 |
| 3.8259 | 2533.9 |
| 3.8274 | 2534.4 |
| 3.8306 | 2535.4 |
| 3.8337 | 2536.4 |
| 3.8353 | 2536.9 |
| 3.8385 | 2538.3 |
| 3.8417 | 2539.8 |
| 3.8432 | 2540.8 |
| 3.8463 | 2542.8 |
| 3.8494 | 2544.7 |
| 3.8511 | 2545.2 |
| 3.8544 | 2547.7 |
| 3.8559 | 2548.6 |
| 3.8592 | 2550.6 |
| 3.8622 | 2553.1 |
| 3.8637 | 2554 |
| 3.867 | 2556.5 |
| 3.8703 | 2558.4 |
| 3.872 | 2559.4 |
| 3.8751 | 2561.9 |
| 3.8782 | 2563.8 |
| 3.8798 | 2564.8 |
| 3.883 | 2566.8 |
| 3.8845 | 2567.8 |
| 3.8879 | 2569.7 |
| 3.891 | 2571.7 |
| 3.8925 | 2573.2 |
| 3.8957 | 2575.6 |
| 3.8989 | 2578.1 |
| 3.9006 | 2579.5 |
| 3.9037 | 2582.5 |
| 3.9068 | 2585.4 |
| 3.9084 | 2586.9 |
| 3.9118 | 2589.3 |
| 3.9133 | 2590.3 |
| 3.9165 | 2592.3 |
| 3.9195 | 2593.8 |
| 3.9211 | 2594.3 |
| 3.9243 | 2594.7 |
| 3.9276 | 2595.2 |
| 3.9291 | 2595.7 |
| 3.9322 | 2595.7 |
| 3.9353 | 2595.7 |
| 3.9369 | 2595.7 |
| 3.9401 | 2596.2 |
| 3.9417 | 2596.7 |
| 3.9449 | 2597.7 |
| 3.9481 | 2599.2 |
| 3.9497 | 2600.1 |
| 3.9529 | 2602.1 |
| 3.9561 | 2605 |
| 3.9576 | 2606 |
| 3.9609 | 2609 |
| 3.964 | 2611.4 |
| 3.9655 | 2612.9 |
| 3.9687 | 2615.3 |
| 3.9704 | 2616.8 |
| 3.9736 | 2619.3 |
| 3.9767 | 2621.2 |
| 3.9783 | 2622.2 |
| 3.9815 | 2624.2 |
| 3.9848 | 2625.6 |
| 3.9863 | 2626.6 |
| 3.9895 | 2628.1 |
| 3.9925 | 2629.1 |
| 3.9941 | 2629.6 |
| 3.9973 | 2630.1 |
| 3.9989 | 2630.6 |
| 4.0023 | 2631 |
| 4.0054 | 2631.5 |
| 4.0069 | 2631.5 |
| 4.01 | 2632 |
| 4.0132 | 2632 |
| 4.0149 | 2632 |
| 4.018 | 2632.5 |
| 4.0211 | 2633 |
| 4.0226 | 2633.5 |
| 4.0259 | 2634 |
| 4.0276 | 2634 |
| 4.0308 | 2635 |
| 4.0339 | 2635.5 |
| 4.0354 | 2635.9 |
| 4.0386 | 2636.4 |
| 4.0419 | 2637.4 |
| 4.0435 | 2637.9 |
| 4.0467 | 2638.4 |
| 4.0498 | 2639.4 |
| 4.0514 | 2639.4 |
| 4.0545 | 2639.9 |
| 4.0577 | 2640.4 |
| 4.0592 | 2640.4 |
| 4.0624 | 2640.4 |
| 4.064 | 2640.4 |
| 4.0672 | 2639.9 |
| 4.0704 | 2639.9 |
| 4.0719 | 2639.4 |
| 4.075 | 2638.9 |
| 4.0782 | 2638.4 |
| 4.0798 | 2638.4 |
| 4.083 | 2637.9 |
| 4.0863 | 2637.4 |
| 4.0878 | 2637.4 |
| 4.091 | 2637.9 |
| 4.0925 | 2637.9 |
| 4.0956 | 2638.4 |
| 4.0988 | 2639.4 |
| 4.1005 | 2639.9 |
| 4.1037 | 2641.3 |
| 4.1069 | 2642.8 |
| 4.1083 | 2643.3 |
| 4.1115 | 2644.3 |
| 4.1147 | 2645.3 |
| 4.1164 | 2645.8 |
| 4.1196 | 2645.8 |
| 4.1227 | 2644.8 |
| 4.1242 | 2644.3 |
| 4.1274 | 2642.3 |
| 4.1291 | 2641.3 |
| 4.1323 | 2638.9 |
| 4.1354 | 2635.9 |
| 4.1369 | 2634 |
| 4.14 | 2630.6 |
| 4.1433 | 2626.6 |
| 4.1449 | 2625.2 |
| 4.1481 | 2622.2 |
| 4.1511 | 2619.3 |
| 4.1527 | 2617.8 |
| 4.156 | 2615.8 |
| 4.1575 | 2614.9 |
| 4.1608 | 2613.4 |
| 4.164 | 2612.4 |
| 4.1655 | 2611.9 |
| 4.1686 | 2610.9 |
| 4.1718 | 2610.4 |
| 4.1734 | 2610 |
| 4.1766 | 2609.5 |
| 4.1799 | 2609 |
| 4.1814 | 2609 |
| 4.1845 | 2608.5 |
| 4.1862 | 2608.5 |
| 4.1893 | 2608.5 |
| 4.1925 | 2608.5 |
| 4.194 | 2609 |
| 4.1971 | 2609 |
| 4.2004 | 2609.5 |
| 4.2021 | 2609.5 |
| 4.2053 | 2610 |
| 4.2083 | 2610.9 |
| 4.2097 | 2610.9 |
| 4.2129 | 2611.9 |
| 4.2147 | 2612.4 |
| 4.218 | 2613.4 |
| 4.2214 | 2614.4 |
| 4.2228 | 2614.9 |
| 4.2258 | 2615.8 |
| 4.229 | 2616.8 |
| 4.2307 | 2617.8 |
| 4.2339 | 2618.8 |
| 4.237 | 2620.3 |
| 4.2385 | 2620.7 |
| 4.2417 | 2622.2 |
| 4.2434 | 2622.7 |
| 4.2466 | 2624.2 |
| 4.2497 | 2625.2 |
| 4.2514 | 2625.6 |
| 4.2545 | 2626.6 |
| 4.2578 | 2627.6 |
| 4.2593 | 2628.1 |
| 4.2625 | 2629.1 |
| 4.2656 | 2630.1 |
| 4.2671 | 2630.1 |
| 4.2703 | 2631 |
| 4.2735 | 2631.5 |
| 4.2751 | 2631.5 |
| 4.2783 | 2632 |
| 4.2799 | 2632 |
| 4.2829 | 2632.5 |
| 4.2861 | 2632.5 |
| 4.2876 | 2632.5 |
| 4.2909 | 2633 |
| 4.2941 | 2633 |
| 4.2957 | 2633 |
| 4.2989 | 2633 |
| 4.3021 | 2633 |
| 4.3036 | 2633 |
| 4.3067 | 2633 |
| 4.3084 | 2633 |
| 4.3115 | 2633 |
| 4.3147 | 2632.5 |
| 4.3164 | 2632.5 |
| 4.3196 | 2632.5 |
| 4.3227 | 2632 |
| 4.3241 | 2631.5 |
| 4.3273 | 2631 |
| 4.3306 | 2630.6 |
| 4.3323 | 2630.6 |
| 4.3355 | 2630.1 |
| 4.337 | 2629.6 |
| 4.3401 | 2629.1 |
| 4.3433 | 2628.6 |
| 4.3448 | 2628.6 |
| 4.3481 | 2628.1 |
| 4.3513 | 2627.6 |
| 4.3529 | 2627.6 |
| 4.356 | 2627.1 |
| 4.3592 | 2626.6 |
| 4.3607 | 2626.6 |
| 4.3638 | 2626.1 |
| 4.3655 | 2626.1 |
| 4.3686 | 2625.6 |
| 4.3718 | 2625.6 |
| 4.3735 | 2625.6 |
| 4.3768 | 2625.6 |
| 4.3799 | 2625.6 |
| 4.3814 | 2625.6 |
| 4.3844 | 2625.6 |
| 4.3877 | 2625.6 |
| 4.3894 | 2626.1 |
| 4.3927 | 2626.1 |
| 4.3958 | 2626.6 |
| 4.3973 | 2627.1 |
| 4.4003 | 2627.6 |
| 4.402 | 2627.6 |
| 4.4052 | 2628.6 |
| 4.4084 | 2629.6 |
| 4.4099 | 2630.1 |
| 4.4131 | 2631 |
| 4.4164 | 2632 |
| 4.4179 | 2632.5 |
| 4.421 | 2634 |
| 4.4242 | 2635 |
| 4.4258 | 2635.9 |
| 4.429 | 2636.9 |
| 4.4305 | 2637.9 |
| 4.4338 | 2639.4 |
| 4.437 | 2640.9 |
| 4.4386 | 2641.3 |
| 4.4416 | 2642.8 |
| 4.4448 | 2644.3 |
| 4.4463 | 2645.3 |
| 4.4495 | 2647.2 |
| 4.4527 | 2648.7 |
| 4.4544 | 2649.7 |
| 4.4574 | 2651.6 |
| 4.4589 | 2652.6 |
| 4.4624 | 2654.6 |
| 4.4656 | 2657 |
| 4.4671 | 2658 |
| 4.4702 | 2660 |
| 4.4734 | 2662.4 |
| 4.4751 | 2663.4 |
| 4.4783 | 2665.4 |
| 4.4814 | 2667.3 |
| 4.4831 | 2668.3 |
| 4.4861 | 2669.8 |
| 4.4877 | 2670.8 |
| 4.4911 | 2671.8 |
| 4.4942 | 2672.7 |
| 4.4957 | 2673.2 |
| 4.4987 | 2673.7 |
| 4.5019 | 2673.7 |
| 4.5036 | 2673.7 |
| 4.5069 | 2673.7 |
| 4.5101 | 2673.2 |
| 4.5116 | 2673.2 |
| 4.5147 | 2672.7 |
| 4.5163 | 2672.7 |
| 4.5195 | 2672.7 |
| 4.5228 | 2672.7 |
| 4.5245 | 2673.2 |
| 4.5276 | 2673.7 |
| 4.5307 | 2674.2 |
| 4.5322 | 2674.7 |
| 4.5353 | 2676.2 |
| 4.5385 | 2678.1 |
| 4.5402 | 2679.1 |
| 4.5433 | 2681.6 |
| 4.5448 | 2683 |
| 4.5482 | 2685.5 |
| 4.5515 | 2688.4 |
| 4.5529 | 2689.9 |
| 4.556 | 2692.4 |
| 4.5591 | 2695.3 |
| 4.5608 | 2696.3 |
| 4.5641 | 2698.7 |
| 4.5674 | 2700.7 |
| 4.5688 | 2701.7 |
| 4.5718 | 2702.7 |
| 4.5735 | 2703.1 |
| 4.5766 | 2704.1 |
| 4.5799 | 2703.6 |
| 4.5816 | 2703.6 |
| 4.5847 | 2702.7 |
| 4.5878 | 2701.2 |
| 4.5894 | 2700.2 |
| 4.5926 | 2698.2 |
| 4.5958 | 2695.8 |
| 4.5974 | 2694.8 |
| 4.6005 | 2692.4 |
| 4.6022 | 2690.9 |
| 4.6054 | 2688.9 |
| 4.6087 | 2687 |
| 4.6102 | 2686.5 |
| 4.6134 | 2685.5 |
| 4.6164 | 2686 |
| 4.6179 | 2686 |
| 4.6212 | 2687.4 |
| 4.6244 | 2689.9 |
| 4.6261 | 2690.9 |
| 4.6291 | 2694.3 |
| 4.6306 | 2695.8 |
| 4.634 | 2699.2 |
| 4.6372 | 2703.1 |
| 4.6387 | 2705.1 |
| 4.6419 | 2708.5 |
| 4.645 | 2712.5 |
| 4.6467 | 2714.4 |
| 4.6499 | 2717.9 |
| 4.6531 | 2720.8 |
| 4.6546 | 2722.3 |
| 4.6577 | 2724.7 |
| 4.6594 | 2725.7 |
| 4.6626 | 2727.7 |
| 4.6658 | 2729.1 |
| 4.6675 | 2729.6 |
| 4.6706 | 2730.1 |
| 4.6736 | 2730.6 |
| 4.6751 | 2730.1 |
| 4.6784 | 2729.6 |
| 4.6817 | 2728.7 |
| 4.6833 | 2728.2 |
| 4.6864 | 2726.7 |
| 4.6878 | 2726.2 |
| 4.6911 | 2724.2 |
| 4.6944 | 2722.3 |
| 4.6959 | 2721.8 |
| 4.6991 | 2719.8 |
| 4.7022 | 2718.4 |
| 4.7039 | 2717.4 |
| 4.707 | 2715.9 |
| 4.7102 | 2714.4 |
| 4.7117 | 2713.9 |
| 4.7148 | 2713 |
| 4.7164 | 2712.5 |
| 4.7198 | 2712 |
| 4.7231 | 2711 |
| 4.7247 | 2711 |
| 4.7278 | 2710.5 |
| 4.7308 | 2710 |
| 4.7324 | 2710 |
| 4.7357 | 2709.5 |
| 4.739 | 2709.5 |
| 4.7406 | 2709 |
| 4.7437 | 2709 |
| 4.7452 | 2709 |
| 4.7483 | 2709 |
| 4.7515 | 2709 |
| 4.753 | 2709 |
| 4.7562 | 2709 |
| 4.7593 | 2709.5 |
| 4.761 | 2709.5 |
| 4.7642 | 2709.5 |
| 4.7674 | 2710 |
| 4.7691 | 2710.5 |
| 4.7722 | 2710.5 |
| 4.7753 | 2711 |
| 4.7768 | 2711.5 |
| 4.7801 | 2712 |
| 4.7818 | 2712.5 |
| 4.785 | 2713 |
| 4.788 | 2713.4 |
| 4.7894 | 2713.9 |
| 4.7927 | 2714.9 |
| 4.7959 | 2715.4 |
| 4.7976 | 2715.4 |
| 4.8008 | 2716.4 |
| 4.8038 | 2716.9 |
| 4.8053 | 2717.4 |
| 4.8085 | 2717.9 |
| 4.8102 | 2717.9 |
| 4.8135 | 2718.4 |
| 4.8165 | 2718.8 |
| 4.818 | 2719.3 |
| 4.8212 | 2719.8 |
| 4.8244 | 2720.3 |
| 4.8261 | 2720.3 |
| 4.8293 | 2720.8 |
| 4.8324 | 2721.3 |
| 4.834 | 2721.8 |
| 4.8372 | 2722.3 |
| 4.8404 | 2722.8 |
| 4.8419 | 2722.8 |
| 4.845 | 2723.3 |
| 4.8466 | 2723.7 |
| 4.8498 | 2723.7 |
| 4.8531 | 2724.2 |
| 4.8546 | 2724.7 |
| 4.8578 | 2724.7 |
| 4.8608 | 2725.2 |
| 4.8625 | 2725.2 |
| 4.8657 | 2725.7 |
| 4.869 | 2725.7 |
| 4.8705 | 2725.7 |
| 4.8736 | 2726.2 |
| 4.8752 | 2726.2 |
| 4.8784 | 2726.2 |
| 4.8816 | 2726.2 |
| 4.8832 | 2726.2 |
| 4.8864 | 2726.2 |
| 4.8894 | 2725.7 |
| 4.8909 | 2725.7 |
| 4.8942 | 2725.2 |
| 4.8974 | 2725.2 |
| 4.8991 | 2724.7 |
| 4.9022 | 2724.7 |
| 4.9052 | 2724.2 |
| 4.9068 | 2723.7 |
| 4.9101 | 2723.3 |
| 4.9118 | 2723.3 |
| 4.915 | 2722.8 |
| 4.9181 | 2721.8 |
| 4.9195 | 2721.3 |
| 4.9226 | 2720.8 |
| 4.9258 | 2719.8 |
| 4.9275 | 2719.8 |
| 4.9307 | 2718.8 |
| 4.9338 | 2717.9 |
| 4.9353 | 2717.4 |
| 4.9386 | 2716.9 |
| 4.9402 | 2716.4 |
| 4.9434 | 2715.4 |
| 4.9465 | 2714.4 |
| 4.9482 | 2714.4 |
| 4.9514 | 2713.4 |
| 4.9546 | 2713 |
| 4.9561 | 2712.5 |
| 4.9593 | 2711.5 |
| 4.9623 | 2711 |
| 4.9639 | 2710.5 |
| 4.9672 | 2710 |
| 4.9687 | 2710 |
| 4.9721 | 2709.5 |
| 4.9752 | 2709 |
| 4.9766 | 2708.5 |
| 4.9798 | 2708.5 |
| 4.983 | 2708.5 |
| 4.9847 | 2708.1 |
| 4.9879 | 2708.1 |
| 4.991 | 2708.1 |
| 4.9925 | 2708.5 |
| 4.9957 | 2708.5 |
| 4.9989 | 2709 |
| 5.0006 | 2709 |
| 5.0037 | 2709.5 |
| 5.0052 | 2710 |
| 5.0084 | 2710.5 |
| 5.0116 | 2711 |
| 5.0133 | 2711.5 |
| 5.0164 | 2712.5 |
| 5.0194 | 2713.9 |
| 5.0209 | 2714.4 |
| 5.0242 | 2715.4 |
| 5.0275 | 2716.9 |
| 5.0291 | 2717.4 |
| 5.0323 | 2718.8 |
| 5.0338 | 2719.3 |
| 5.0369 | 2720.3 |
| 5.0402 | 2721.3 |
| 5.0417 | 2721.3 |
| 5.045 | 2721.8 |
| 5.0481 | 2721.8 |
| 5.0497 | 2721.8 |
| 5.0528 | 2720.8 |
| 5.056 | 2719.8 |
| 5.0575 | 2719.3 |
| 5.0607 | 2718.4 |
| 5.0623 | 2717.4 |
| 5.0654 | 2715.9 |
| 5.0687 | 2714.9 |
| 5.0704 | 2713.9 |
| 5.0736 | 2713 |
| 5.0766 | 2712.5 |
| 5.0781 | 2712 |
| 5.0813 | 2712 |
| 5.0846 | 2712 |
| 5.0864 | 2712 |
| 5.0895 | 2712.5 |
| 5.091 | 2712.5 |
| 5.0942 | 2713.4 |
| 5.0973 | 2713.9 |
| 5.0988 | 2714.4 |
| 5.102 | 2715.9 |
| 5.1052 | 2716.9 |
| 5.1068 | 2717.9 |
| 5.11 | 2719.8 |
| 5.1132 | 2721.3 |
| 5.1147 | 2722.8 |
| 5.1178 | 2724.7 |
| 5.1209 | 2727.2 |
| 5.1226 | 2728.7 |
| 5.1259 | 2731.6 |
| 5.1276 | 2733.1 |
| 5.1308 | 2736 |
| 5.1339 | 2739 |
| 5.1353 | 2740.4 |
| 5.1384 | 2743.4 |
| 5.1417 | 2746.3 |
| 5.1434 | 2748.3 |
| 5.1466 | 2750.7 |
| 5.1497 | 2753.7 |
| 5.1511 | 2754.6 |
| 5.1543 | 2757.1 |
| 5.1575 | 2759.6 |
| 5.1593 | 2760.5 |
| 5.1624 | 2762 |
| 5.1639 | 2763 |
| 5.167 | 2764.5 |
| 5.1702 | 2765.9 |
| 5.1719 | 2766.4 |
| 5.1751 | 2767.4 |
| 5.1782 | 2768.4 |
| 5.1798 | 2768.9 |
| 5.183 | 2770.3 |
| 5.1845 | 2770.8 |
| 5.1879 | 2772.3 |
| 5.191 | 2774.3 |
| 5.1924 | 2775.2 |
| 5.1956 | 2777.2 |
| 5.1989 | 2779.7 |
| 5.2006 | 2781.1 |
| 5.2038 | 2784.1 |
| 5.2069 | 2788 |
| 5.2083 | 2789.5 |
| 5.2115 | 2793.9 |
| 5.2132 | 2796.3 |
| 5.2164 | 2801.7 |
| 5.2196 | 2807.1 |
| 5.2212 | 2810.1 |
| 5.2243 | 2816 |
| 5.2275 | 2821.8 |
| 5.229 | 2824.8 |
| 5.2322 | 2830.7 |
| 5.2353 | 2836.1 |
| 5.2369 | 2838.5 |
| 5.2402 | 2842.9 |
| 5.2417 | 2844.9 |
| 5.2451 | 2848.3 |
| 5.2483 | 2851.3 |
| 5.2497 | 2852.3 |
| 5.2527 | 2854.2 |
| 5.256 | 2855.7 |
| 5.2577 | 2856.2 |
| 5.261 | 2857.2 |
| 5.2641 | 2858.1 |
| 5.2655 | 2858.6 |
| 5.2686 | 2859.6 |
| 5.2703 | 2860.1 |
| 5.2737 | 2861.1 |
| 5.2769 | 2862.1 |
| 5.2784 | 2862.6 |
| 5.2815 | 2863.5 |
| 5.2847 | 2864.5 |
| 5.2864 | 2865 |
| 5.2896 | 2866 |
| 5.2927 | 2867 |
| 5.2942 | 2867.5 |
| 5.2974 | 2868.4 |
| 5.2991 | 2868.4 |
| 5.3023 | 2869.4 |
| 5.3055 | 2869.9 |
| 5.3069 | 2869.9 |
| 5.3099 | 2869.9 |
| 5.3132 | 2869.4 |
| 5.3149 | 2868.9 |
| 5.3181 | 2868.4 |
| 5.3212 | 2867 |
| 5.3227 | 2866 |
| 5.3258 | 2864.5 |
| 5.329 | 2862.6 |
| 5.3307 | 2861.6 |
| 5.334 | 2859.1 |
| 5.3356 | 2858.1 |
| 5.3387 | 2856.2 |
| 5.3419 | 2854.2 |
| 5.3434 | 2853.2 |
| 5.3466 | 2851.8 |
| 5.3498 | 2850.3 |
| 5.3514 | 2849.8 |
| 5.3545 | 2848.8 |
| 5.3577 | 2848.3 |
| 5.3593 | 2847.8 |
| 5.3624 | 2847.4 |
| 5.3641 | 2847.4 |
| 5.3671 | 2846.9 |
| 5.3703 | 2846.9 |
| 5.3719 | 2846.9 |
| 5.3752 | 2846.9 |
| 5.3783 | 2846.9 |
| 5.3799 | 2846.9 |
| 5.3829 | 2846.9 |
| 5.3861 | 2846.9 |
| 5.3878 | 2846.9 |
| 5.3911 | 2847.4 |
| 5.3926 | 2847.4 |
| 5.3959 | 2847.4 |
| 5.399 | 2847.4 |
| 5.4005 | 2847.4 |
| 5.4037 | 2847.8 |
| 5.4068 | 2847.8 |
| 5.4085 | 2847.8 |
| 5.4116 | 2847.8 |
| 5.4149 | 2847.8 |
| 5.4164 | 2847.8 |
| 5.4196 | 2848.3 |
| 5.4227 | 2848.3 |
| 5.4243 | 2848.3 |
| 5.4275 | 2848.3 |
| 5.429 | 2848.3 |
| 5.4323 | 2848.8 |
| 5.4355 | 2848.8 |
| 5.4372 | 2848.8 |
| 5.4402 | 2849.3 |
| 5.4433 | 2849.3 |
| 5.4448 | 2849.3 |
| 5.4481 | 2849.8 |
| 5.4512 | 2849.8 |
| 5.4528 | 2850.3 |
| 5.456 | 2850.3 |
| 5.4575 | 2850.3 |
| 5.4607 | 2850.8 |
| 5.4641 | 2850.8 |
| 5.4656 | 2850.8 |
| 5.4686 | 2850.8 |
| 5.4718 | 2851.3 |
| 5.4736 | 2851.3 |
| 5.4768 | 2851.8 |
| 5.48 | 2851.8 |
| 5.4814 | 2852.3 |
| 5.4844 | 2852.7 |
| 5.4861 | 2852.7 |
| 5.4894 | 2853.2 |
| 5.4926 | 2853.7 |
| 5.4943 | 2854.2 |
| 5.4973 | 2854.7 |
| 5.5004 | 2855.2 |
| 5.5019 | 2855.7 |
| 5.5052 | 2856.2 |
| 5.5084 | 2856.2 |
| 5.5101 | 2856.2 |
| 5.5132 | 2856.2 |
| 5.5147 | 2855.7 |
| 5.5181 | 2855.2 |
| 5.5212 | 2854.7 |
| 5.5227 | 2854.2 |
| 5.5259 | 2853.2 |
| 5.5292 | 2852.3 |
| 5.5307 | 2851.8 |
| 5.5339 | 2850.8 |
| 5.537 | 2849.3 |
| 5.5386 | 2849.3 |
| 5.5417 | 2848.3 |
| 5.5432 | 2847.8 |
| 5.5465 | 2847.4 |
| 5.5498 | 2846.9 |
| 5.5515 | 2846.4 |
| 5.5545 | 2846.4 |
| 5.5576 | 2845.9 |
| 5.5593 | 2845.9 |
| 5.5625 | 2845.4 |
| 5.5658 | 2845.4 |
| 5.5673 | 2845.4 |
| 5.5703 | 2844.9 |
| 5.572 | 2844.9 |
| 5.5752 | 2844.4 |
| 5.5783 | 2843.9 |
| 5.5798 | 2843.4 |
| 5.5829 | 2842.9 |
| 5.5861 | 2842.4 |
| 5.5878 | 2842.4 |
| 5.5911 | 2842 |
| 5.5943 | 2841.5 |
| 5.5959 | 2841.5 |
| 5.5989 | 2841 |
| 5.6021 | 2840.5 |
| 5.6037 | 2840.5 |
| 5.607 | 2840.5 |
| 5.6087 | 2840 |
| 5.6118 | 2840 |
| 5.6148 | 2840 |
| 5.6163 | 2840 |
| 5.6195 | 2840.5 |
| 5.6227 | 2840.5 |
| 5.6244 | 2840.5 |
| 5.6275 | 2841 |
| 5.6307 | 2841.5 |
| 5.6322 | 2841.5 |
| 5.6354 | 2842 |
| 5.637 | 2842 |
| 5.6402 | 2842.4 |
| 5.6433 | 2842.9 |
| 5.6448 | 2842.9 |
| 5.6481 | 2843.4 |
| 5.6515 | 2843.9 |
| 5.653 | 2844.4 |
| 5.656 | 2844.9 |
| 5.6591 | 2845.4 |
| 5.6608 | 2845.4 |
| 5.6641 | 2845.9 |
| 5.6673 | 2846.4 |
| 5.6687 | 2846.9 |
| 5.6718 | 2847.4 |
| 5.6734 | 2847.8 |
| 5.6767 | 2848.3 |
| 5.6799 | 2848.3 |
| 5.6815 | 2848.8 |
| 5.6845 | 2848.8 |
| 5.6877 | 2848.8 |
| 5.6894 | 2848.8 |
| 5.6926 | 2848.8 |
| 5.6958 | 2848.3 |
| 5.6973 | 2847.8 |
| 5.7003 | 2846.9 |
| 5.702 | 2846.4 |
| 5.7052 | 2845.4 |
| 5.7084 | 2843.9 |
| 5.7101 | 2843.4 |
| 5.7131 | 2842 |
| 5.7162 | 2840.5 |
| 5.7178 | 2839.5 |
| 5.7211 | 2838 |
| 5.7243 | 2836.6 |
| 5.726 | 2835.6 |
| 5.729 | 2834.1 |
| 5.7304 | 2833.6 |
| 5.7338 | 2832.1 |
| 5.7371 | 2831.2 |
| 5.7386 | 2830.7 |
| 5.7418 | 2830.2 |
| 5.7448 | 2829.7 |
| 5.7465 | 2829.7 |
| 5.7497 | 2829.7 |
| 5.7528 | 2829.7 |
| 5.7543 | 2830.2 |
| 5.7574 | 2830.7 |
| 5.7591 | 2831.2 |
| 5.7624 | 2832.6 |
| 5.7656 | 2833.6 |
| 5.7673 | 2834.6 |
| 5.7703 | 2836.1 |
| 5.7734 | 2838 |
| 5.775 | 2839 |
| 5.7782 | 2841 |
| 5.7815 | 2842.9 |
| 5.7832 | 2843.9 |
| 5.7862 | 2845.9 |
| 5.7877 | 2846.4 |
| 5.791 | 2848.3 |
| 5.7942 | 2850.8 |
| 5.7957 | 2851.8 |
| 5.7989 | 2853.7 |
| 5.8021 | 2856.2 |
| 5.8037 | 2857.2 |
| 5.8069 | 2859.1 |
| 5.8101 | 2861.6 |
| 5.8117 | 2862.6 |
| 5.8148 | 2865 |
| 5.8163 | 2866 |
| 5.8195 | 2868 |
| 5.8229 | 2869.4 |
| 5.8245 | 2870.4 |
| 5.8276 | 2871.4 |
| 5.8306 | 2872.4 |
| 5.8323 | 2872.9 |
| 5.8355 | 2873.3 |
| 5.8387 | 2873.8 |
| 5.8403 | 2873.8 |
| 5.8434 | 2873.8 |
| 5.8465 | 2873.3 |
| 5.8481 | 2873.3 |
| 5.8514 | 2872.9 |
| 5.8529 | 2872.9 |
| 5.8561 | 2872.4 |
| 5.8592 | 2871.9 |
| 5.8608 | 2871.9 |
| 5.8641 | 2871.4 |
| 5.8673 | 2870.9 |
| 5.8687 | 2870.9 |
| 5.8719 | 2870.9 |
| 5.875 | 2870.9 |
| 5.8767 | 2870.4 |
| 5.8799 | 2870.4 |
| 5.8814 | 2870.4 |
| 5.8845 | 2870.4 |
| 5.8876 | 2870.4 |
| 5.8892 | 2870.4 |
| 5.8925 | 2870.4 |
| 5.8958 | 2869.9 |
| 5.8973 | 2869.9 |
| 5.9006 | 2869.9 |
| 5.9036 | 2869.4 |
| 5.9051 | 2869.4 |
| 5.9084 | 2868.9 |
| 5.9116 | 2868.4 |
| 5.9133 | 2868.4 |
| 5.9164 | 2868 |
| 5.9178 | 2868 |
| 5.921 | 2868 |
| 5.9242 | 2868 |
| 5.9259 | 2868 |
| 5.929 | 2868.4 |
| 5.9321 | 2868.9 |
| 5.9336 | 2868.9 |
| 5.9369 | 2869.9 |
| 5.9401 | 2870.4 |
| 5.9418 | 2870.9 |
| 5.9448 | 2871.9 |
| 5.9462 | 2871.9 |
| 5.9495 | 2872.4 |
| 5.9528 | 2872.9 |
| 5.9545 | 2872.9 |
| 5.9577 | 2872.9 |
| 5.9607 | 2872.4 |
| 5.9621 | 2871.9 |
| 5.9654 | 2870.9 |
| 5.9687 | 2869.9 |
| 5.9702 | 2868.9 |
| 5.9734 | 2867.5 |
| 5.9765 | 2865.5 |
| 5.9782 | 2864.5 |
| 5.9814 | 2862.6 |
| 5.9829 | 2861.6 |
| 5.986 | 2860.1 |
| 5.9892 | 2858.6 |
| 5.9909 | 2857.7 |
| 5.9941 | 2856.7 |
| 5.9973 | 2855.7 |
| 5.9989 | 2855.7 |
| 6.0019 | 2855.2 |
| 6.0049 | 2855.2 |
| 6.0066 | 2855.2 |
| 6.0099 | 2855.7 |
| 6.0114 | 2856.2 |
| 6.0148 | 2856.7 |
| 6.0178 | 2857.7 |
| 6.0193 | 2858.1 |
| 6.0224 | 2859.6 |
| 6.0257 | 2860.6 |
| 6.0274 | 2861.1 |
| 6.0306 | 2862.6 |
| 6.0336 | 2864 |
| 6.0352 | 2864.5 |
| 6.0384 | 2866 |
| 6.0401 | 2866.5 |
| 6.0433 | 2867.5 |
| 6.0464 | 2868.4 |
| 6.048 | 2868.4 |
| 6.0512 | 2869.4 |
| 6.0544 | 2869.9 |
| 6.0559 | 2869.9 |
| 6.0591 | 2870.4 |
| 6.0621 | 2870.9 |
| 6.0638 | 2871.4 |
| 6.0671 | 2871.9 |
| 6.0686 | 2872.4 |
| 6.072 | 2873.3 |
| 6.075 | 2874.8 |
| 6.0765 | 2875.3 |
| 6.0796 | 2877.3 |
| 6.0829 | 2879.2 |
| 6.0846 | 2880.2 |
| 6.0878 | 2882.2 |
| 6.0909 | 2884.1 |
| 6.0924 | 2884.6 |
| 6.0955 | 2886.6 |
| 6.0972 | 2887.6 |
| 6.1003 | 2888.6 |
| 6.1035 | 2890 |
| 6.1051 | 2890 |
| 6.1083 | 2891 |
| 6.1116 | 2891.5 |
| 6.1133 | 2891.5 |
| 6.1164 | 2891.5 |
| 6.1194 | 2891.5 |
| 6.1209 | 2891.5 |
| 6.1242 | 2891.5 |
| 6.1259 | 2891.5 |
| 6.1292 | 2891.5 |
| 6.1323 | 2891.5 |
| 6.1337 | 2891.5 |
| 6.137 | 2892 |
| 6.1402 | 2892 |
| 6.1417 | 2892 |
| 6.1449 | 2892.5 |
| 6.148 | 2893 |
| 6.1496 | 2893.5 |
| 6.1528 | 2894 |
| 6.156 | 2894.4 |
| 6.1575 | 2894.9 |
| 6.1607 | 2895.4 |
| 6.1623 | 2895.9 |
| 6.1655 | 2896.4 |
| 6.1687 | 2896.9 |
| 6.1703 | 2897.4 |
| 6.1735 | 2897.9 |
| 6.1765 | 2897.9 |
| 6.1781 | 2898.4 |
| 6.1813 | 2898.4 |
| 6.1845 | 2898.9 |
| 6.1861 | 2899.3 |
| 6.1892 | 2899.8 |
| 6.1908 | 2899.8 |
| 6.1939 | 2900.8 |
| 6.1971 | 2901.3 |
| 6.1989 | 2901.8 |
| 6.2021 | 2902.3 |
| 6.2052 | 2902.8 |
| 6.2067 | 2903.3 |
| 6.2099 | 2903.8 |
| 6.2131 | 2904.7 |
| 6.2148 | 2905.2 |
| 6.2179 | 2906.2 |
| 6.2194 | 2906.7 |
| 6.2227 | 2908.2 |
| 6.2259 | 2909.2 |
| 6.2274 | 2909.6 |
| 6.2306 | 2910.6 |
| 6.2336 | 2911.6 |
| 6.2352 | 2912.1 |
| 6.2384 | 2912.6 |
| 6.2417 | 2913.1 |
| 6.2433 | 2913.1 |
| 6.2465 | 2913.1 |
| 6.2481 | 2913.1 |
| 6.2511 | 2912.6 |
| 6.2543 | 2911.6 |
| 6.256 | 2911.6 |
| 6.2593 | 2910.1 |
| 6.2624 | 2909.2 |
| 6.2639 | 2908.7 |
| 6.267 | 2907.7 |
| 6.2702 | 2906.7 |
| 6.2718 | 2906.2 |
| 6.275 | 2905.7 |
| 6.2765 | 2905.2 |
| 6.2798 | 2904.7 |
| 6.283 | 2904.3 |
| 6.2846 | 2903.8 |
| 6.2878 | 2903.8 |
| 6.2909 | 2903.8 |
| 6.2924 | 2903.8 |
| 6.2956 | 2903.8 |
| 6.2989 | 2903.8 |
| 6.3004 | 2904.3 |
| 6.3036 | 2904.3 |
| 6.3053 | 2904.7 |
| 6.3085 | 2905.2 |
| 6.3116 | 2905.7 |
| 6.3131 | 2906.2 |
| 6.3164 | 2906.7 |
| 6.3196 | 2907.7 |
| 6.3212 | 2908.2 |
| 6.3243 | 2908.7 |
| 6.3276 | 2909.6 |
| 6.3291 | 2910.1 |
| 6.3322 | 2910.6 |
| 6.3339 | 2911.1 |
| 6.337 | 2911.6 |
| 6.3402 | 2912.1 |
| 6.3419 | 2912.6 |
| 6.3452 | 2913.1 |
| 6.3483 | 2913.1 |
| 6.3497 | 2913.6 |
| 6.3528 | 2913.6 |
| 6.356 | 2913.6 |
| 6.3577 | 2913.6 |
| 6.3609 | 2913.6 |
| 6.3624 | 2913.1 |
| 6.3656 | 2913.1 |
| 6.3687 | 2912.6 |
| 6.3703 | 2912.6 |
| 6.3735 | 2912.1 |
| 6.3768 | 2911.6 |
| 6.3784 | 2911.1 |
| 6.3815 | 2910.6 |
| 6.3847 | 2910.1 |
| 6.3862 | 2909.6 |
| 6.3894 | 2909.2 |
| 6.3911 | 2908.7 |
| 6.3942 | 2908.2 |
| 6.3974 | 2907.7 |
| 6.3991 | 2907.2 |
| 6.4023 | 2906.7 |
| 6.4054 | 2905.7 |
| 6.4068 | 2905.7 |
| 6.4099 | 2904.7 |
| 6.4132 | 2904.3 |
| 6.4149 | 2903.8 |
| 6.4182 | 2903.3 |
| 6.4196 | 2902.8 |
| 6.4228 | 2902.3 |
| 6.426 | 2901.8 |
| 6.4276 | 2901.8 |
| 6.4309 | 2901.3 |
| 6.4341 | 2900.8 |
| 6.4356 | 2900.8 |
| 6.4387 | 2900.3 |
| 6.4418 | 2900.3 |
| 6.4435 | 2900.3 |
| 6.4467 | 2899.8 |
| 6.4482 | 2899.8 |
| 6.4513 | 2899.8 |
| 6.4544 | 2899.8 |
| 6.4562 | 2899.8 |
| 6.4594 | 2899.8 |
| 6.4626 | 2899.8 |
| 6.4641 | 2899.8 |
| 6.4671 | 2899.8 |
| 6.4703 | 2900.3 |
| 6.472 | 2900.3 |
| 6.4753 | 2900.3 |
| 6.4785 | 2900.8 |
| 6.4801 | 2900.8 |
| 6.4857 | 2901.3 |
| 6.4873 | 2901.8 |
| 6.4906 | 2902.3 |
| 6.4937 | 2902.8 |
| 6.4951 | 2903.3 |
| 6.4983 | 2903.8 |
| 6.5015 | 2904.7 |
| 6.5032 | 2904.7 |
| 6.5064 | 2905.7 |
| 6.5095 | 2906.2 |
| 6.511 | 2906.7 |
| 6.5142 | 2907.2 |
| 6.5159 | 2907.7 |
| 6.5192 | 2908.2 |
| 6.5223 | 2908.2 |
| 6.5238 | 2908.2 |
| 6.5269 | 2908.7 |
| 6.5302 | 2908.7 |
| 6.5317 | 2908.7 |
| 6.535 | 2908.2 |
| 6.538 | 2907.7 |
| 6.5396 | 2907.7 |
| 6.5428 | 2907.2 |
| 6.5443 | 2906.7 |
| 6.5477 | 2905.7 |
| 6.5509 | 2905.2 |
| 6.5524 | 2904.7 |
| 6.5556 | 2903.8 |
| 6.5587 | 2903.3 |
| 6.5604 | 2902.8 |
| 6.5636 | 2902.3 |
| 6.5667 | 2901.8 |
| 6.5682 | 2901.3 |
| 6.5714 | 2901.3 |
| 6.5731 | 2901.3 |
| 6.5762 | 2900.8 |
| 6.5794 | 2900.8 |
| 6.5809 | 2900.8 |
| 6.5841 | 2900.8 |
| 6.5874 | 2900.8 |
| 6.5889 | 2900.8 |
| 6.5921 | 2900.8 |
| 6.5952 | 2901.3 |
| 6.5968 | 2901.3 |
| 6.6 | 2901.8 |
| 6.6032 | 2902.8 |
| 6.6048 | 2903.3 |
| 6.608 | 2904.7 |
| 6.6096 | 2905.7 |
| 6.6127 | 2907.2 |
| 6.6159 | 2909.2 |
| 6.6174 | 2910.1 |
| 6.6205 | 2912.6 |
| 6.6237 | 2915 |
| 6.6253 | 2916 |
| 6.6285 | 2918 |
| 6.6318 | 2920.4 |
| 6.6334 | 2921.4 |
| 6.6366 | 2922.9 |
| 6.6381 | 2923.9 |
| 6.6411 | 2924.9 |
| 6.6443 | 2925.8 |
| 6.6461 | 2926.3 |
| 6.6493 | 2926.3 |
| 6.6525 | 2926.3 |
| 6.6539 | 2926.3 |
| 6.6569 | 2926.3 |
| 6.6601 | 2925.8 |
| 6.6618 | 2925.8 |
| 6.6651 | 2925.8 |
| 6.6666 | 2925.8 |
| 6.6698 | 2925.8 |
| 6.673 | 2926.3 |
| 6.6745 | 2926.8 |
| 6.6777 | 2927.8 |
| 6.6809 | 2929.3 |
| 6.6825 | 2929.8 |
| 6.6857 | 2931.7 |
| 6.6889 | 2933.2 |
| 6.6905 | 2934.2 |
| 6.6937 | 2936.6 |
| 6.6967 | 2938.6 |
| 6.6983 | 2939.6 |
| 6.7015 | 2941.5 |
| 6.7032 | 2942.5 |
| 6.7064 | 2944 |
| 6.7096 | 2945.9 |
| 6.711 | 2946.4 |
| 6.7141 | 2947.9 |
| 6.7173 | 2949.4 |
| 6.719 | 2949.9 |
| 6.7223 | 2950.8 |
| 6.7254 | 2951.8 |
| 6.7268 | 2951.8 |
| 6.73 | 2952.3 |
| 6.7317 | 2952.8 |
| 6.7349 | 2952.8 |
| 6.7381 | 2952.3 |
| 6.7396 | 2951.8 |
| 6.7429 | 2950.8 |
| 6.7461 | 2949.4 |
| 6.7476 | 2948.4 |
| 6.7508 | 2946.4 |
| 6.7539 | 2944 |
| 6.7554 | 2943 |
| 6.7586 | 2940.5 |
| 6.7602 | 2939.1 |
| 6.7636 | 2936.1 |
| 6.7668 | 2933.7 |
| 6.7683 | 2932.7 |
| 6.7713 | 2930.7 |
| 6.7745 | 2929.3 |
| 6.7762 | 2928.8 |
| 6.7794 | 2928.8 |
| 6.7826 | 2929.3 |
| 6.7841 | 2929.8 |
| 6.7871 | 2931.2 |
| 6.7889 | 2932.2 |
| 6.792 | 2934.7 |
| 6.7952 | 2938.1 |
| 6.7968 | 2939.6 |
| 6.7999 | 2943.5 |
| 6.8032 | 2947.4 |
| 6.8047 | 2948.9 |
| 6.8079 | 2952.8 |
| 6.8111 | 2956.2 |
| 6.8126 | 2957.7 |
| 6.8158 | 2960.2 |
| 6.8191 | 2962.6 |
| 6.8206 | 2963.6 |
| 6.8239 | 2965.6 |
| 6.8255 | 2966.1 |
| 6.8285 | 2967.5 |
| 6.8316 | 2968.5 |
| 6.8332 | 2969 |
| 6.8364 | 2970 |
| 6.8396 | 2971 |
| 6.8412 | 2971.4 |
| 6.8443 | 2972.9 |
| 6.8475 | 2974.4 |
| 6.8492 | 2974.9 |
| 6.8524 | 2976.4 |
| 6.8539 | 2976.8 |
| 6.8569 | 2978.3 |
| 6.8601 | 2979.8 |
| 6.8619 | 2980.3 |
| 6.8651 | 2980.8 |
| 6.8683 | 2981.3 |
| 6.8697 | 2981.3 |
| 6.8727 | 2981.3 |
| 6.876 | 2980.8 |
| 6.8777 | 2980.3 |
| 6.8809 | 2979.3 |
| 6.8825 | 2978.8 |
| 6.8857 | 2977.3 |
| 6.8888 | 2976.4 |
| 6.8903 | 2975.4 |
| 6.8935 | 2974.4 |
| 6.8968 | 2973.4 |
| 6.8984 | 2972.9 |
| 6.9015 | 2972.4 |
| 6.9047 | 2972.4 |
| 6.9062 | 2972.4 |
| 6.9094 | 2972.4 |
| 6.9111 | 2972.9 |
| 6.9142 | 2972.4 |
| 6.9174 | 2972.4 |
| 6.919 | 2971.9 |
| 6.9223 | 2971 |
| 6.9254 | 2969.5 |
| 6.9269 | 2968.5 |
| 6.9299 | 2966.1 |
| 6.9331 | 2963.1 |
| 6.9348 | 2961.1 |
| 6.9381 | 2958.2 |
| 6.9398 | 2956.2 |
| 6.9429 | 2953.3 |
| 6.946 | 2950.8 |
| 6.9476 | 2949.4 |
| 6.9509 | 2947.4 |
| 6.9541 | 2945.5 |
| 6.9556 | 2945 |
| 6.9587 | 2944 |
| 6.9618 | 2943.5 |
| 6.9635 | 2943 |
| 6.9667 | 2943 |
| 6.9682 | 2943 |
| 6.9715 | 2942.5 |
| 6.9746 | 2942.5 |
| 6.9762 | 2942.5 |
| 6.9794 | 2942.5 |
| 6.9826 | 2943 |
| 6.9843 | 2943 |
| 6.9873 | 2943.5 |
| 6.9904 | 2944.5 |
| 6.992 | 2945 |
| 6.9953 | 2945.9 |
| 6.997 | 2946.9 |
| 7.0001 | 2948.4 |
| 7.0032 | 2949.9 |
| 7.0048 | 2950.8 |
| 7.008 | 2952.3 |
| 7.0112 | 2954.3 |
| 7.0127 | 2954.8 |
| 7.0158 | 2956.2 |
| 7.019 | 2957.2 |
| 7.0207 | 2957.7 |
| 7.0239 | 2958.2 |
| 7.0254 | 2958.7 |
| 7.0287 | 2958.2 |
| 7.0318 | 2957.7 |
| 7.0333 | 2957.2 |
| 7.0366 | 2955.8 |
| 7.0398 | 2954.3 |
| 7.0415 | 2953.3 |
| 7.0445 | 2951.3 |
| 7.0476 | 2949.4 |
| 7.0492 | 2948.4 |
| 7.0524 | 2946.4 |
| 7.0541 | 2945.5 |
| 7.0573 | 2944 |
| 7.0603 | 2943 |
| 7.0619 | 2942.5 |
| 7.0651 | 2942 |
| 7.0684 | 2942 |
| 7.0699 | 2942 |
| 7.0732 | 2942.5 |
| 7.0764 | 2942.5 |
| 7.0779 | 2943 |
| 7.0811 | 2943.5 |
| 7.0842 | 2944 |
| 7.0859 | 2944 |
| 7.089 | 2944.5 |
| 7.0905 | 2944.5 |
| 7.0937 | 2944.5 |
| 7.0969 | 2944.5 |
| 7.0986 | 2944.5 |
| 7.1017 | 2944.5 |
| 7.1048 | 2944.5 |
| 7.1063 | 2944.5 |
| 7.1096 | 2944.5 |
| 7.1128 | 2944.5 |
| 7.1145 | 2944.5 |
| 7.1175 | 2944.5 |
| 7.119 | 2944.5 |
| 7.1221 | 2944.5 |
| 7.1254 | 2945 |
| 7.1271 | 2945 |
| 7.1303 | 2945.5 |
| 7.1333 | 2945.9 |
| 7.1348 | 2946.4 |
| 7.138 | 2946.9 |
| 7.1411 | 2947.9 |
| 7.1428 | 2948.4 |
| 7.1459 | 2948.9 |
| 7.1491 | 2949.9 |
| 7.1509 | 2950.4 |
| 7.1541 | 2951.3 |
| 7.1557 | 2951.8 |
| 7.1587 | 2952.3 |
| 7.1618 | 2953.3 |
| 7.1634 | 2953.3 |
| 7.1667 | 2954.3 |
| 7.17 | 2954.8 |
| 7.1715 | 2954.8 |
| 7.1746 | 2955.3 |
| 7.1777 | 2955.8 |
| 7.1793 | 2955.8 |
| 7.1825 | 2956.2 |
| 7.184 | 2956.2 |
| 7.1873 | 2956.2 |
| 7.1903 | 2956.7 |
| 7.192 | 2956.7 |
| 7.1952 | 2956.7 |
| 7.1984 | 2956.7 |
| 7.1999 | 2956.7 |
| 7.203 | 2957.2 |
| 7.2061 | 2957.2 |
| 7.2078 | 2957.2 |
| 7.2111 | 2957.2 |
| 7.2143 | 2957.2 |
| 7.2159 | 2957.2 |
| 7.2189 | 2957.7 |
| 7.2204 | 2957.7 |
| 7.2236 | 2957.7 |
| 7.2269 | 2957.7 |
| 7.2286 | 2958.2 |
| 7.2317 | 2958.2 |
| 7.2348 | 2958.2 |
| 7.2363 | 2958.2 |
| 7.2395 | 2958.7 |
| 7.2427 | 2958.7 |
| 7.2444 | 2958.7 |
| 7.2475 | 2958.7 |
| 7.249 | 2958.7 |
| 7.2523 | 2958.7 |
| 7.2554 | 2958.7 |
| 7.2571 | 2959.2 |
| 7.2603 | 2959.2 |
| 7.2633 | 2959.2 |
| 7.2649 | 2958.7 |
| 7.2681 | 2958.7 |
| 7.2712 | 2958.7 |
| 7.2729 | 2958.7 |
| 7.2759 | 2958.7 |
| 7.2791 | 2959.2 |
| 7.2808 | 2959.2 |
| 7.2841 | 2959.2 |
| 7.2856 | 2959.7 |
| 7.2888 | 2959.7 |
| 7.2918 | 2960.2 |
| 7.2935 | 2960.2 |
| 7.2967 | 2960.7 |
| 7.2999 | 2961.1 |
| 7.3015 | 2961.1 |
| 7.3046 | 2961.6 |
| 7.3077 | 2962.1 |
| 7.3094 | 2962.1 |
| 7.3125 | 2962.6 |
| 7.314 | 2962.6 |
| 7.3172 | 2963.1 |
| 7.3203 | 2963.6 |
| 7.3219 | 2963.6 |
| 7.3252 | 2963.6 |
| 7.3285 | 2964.1 |
| 7.33 | 2964.1 |
| 7.333 | 2964.6 |
| 7.3363 | 2964.6 |
| 7.3378 | 2965.1 |
| 7.3411 | 2965.1 |
| 7.3443 | 2965.1 |
| 7.346 | 2965.6 |
| 7.349 | 2965.6 |
| 7.3505 | 2965.6 |
| 7.3536 | 2965.6 |
| 7.3568 | 2965.6 |
| 7.3585 | 2965.6 |
| 7.3617 | 2965.6 |
| 7.3648 | 2965.6 |
| 7.3663 | 2965.6 |
| 7.3695 | 2965.6 |
| 7.3727 | 2965.1 |
| 7.3744 | 2965.1 |
| 7.3775 | 2964.6 |
| 7.379 | 2964.6 |
| 7.3823 | 2964.1 |
| 7.3855 | 2964.1 |
| 7.3872 | 2963.6 |
| 7.3903 | 2963.1 |
| 7.3933 | 2962.6 |
| 7.3948 | 2962.6 |
| 7.398 | 2962.1 |
| 7.4012 | 2961.6 |
| 7.4029 | 2961.1 |
| 7.406 | 2960.7 |
| 7.4091 | 2960.2 |
| 7.4108 | 2959.7 |
| 7.414 | 2959.2 |
| 7.4156 | 2959.2 |
| 7.4188 | 2958.7 |
| 7.4218 | 2958.2 |
| 7.4235 | 2957.7 |
| 7.4267 | 2957.2 |
| 7.4299 | 2956.7 |
| 7.4314 | 2956.7 |
| 7.4345 | 2956.2 |
| 7.4377 | 2955.8 |
| 7.4394 | 2955.8 |
| 7.4426 | 2955.3 |
| 7.4441 | 2955.3 |
| 7.4472 | 2954.8 |
| 7.4502 | 2954.8 |
| 7.4519 | 2954.3 |
| 7.4552 | 2954.3 |
| 7.4585 | 2953.8 |
| 7.4602 | 2953.8 |
| 7.4633 | 2953.3 |
| 7.4663 | 2953.3 |
| 7.4678 | 2952.8 |
| 7.471 | 2952.8 |
| 7.4743 | 2952.3 |
| 7.4759 | 2952.3 |
| 7.479 | 2952.3 |
| 7.4805 | 2952.3 |
| 7.4837 | 2952.3 |
| 7.4868 | 2952.3 |
| 7.4885 | 2952.3 |
| 7.4916 | 2952.3 |
| 7.4948 | 2952.3 |
| 7.4963 | 2952.3 |
| 7.4995 | 2952.3 |
| 7.5028 | 2952.3 |
| 7.5044 | 2951.8 |
| 7.5075 | 2951.3 |
| 7.5089 | 2951.3 |
| 7.5123 | 2950.4 |
| 7.5156 | 2949.4 |
| 7.5171 | 2948.9 |
| 7.5203 | 2947.4 |
| 7.5234 | 2945.9 |
| 7.525 | 2945 |
| 7.5282 | 2943.5 |
| 7.5313 | 2942.5 |
| 7.5329 | 2942 |
| 7.536 | 2941.5 |
| 7.5376 | 2941 |
| 7.5408 | 2941 |
| 7.544 | 2941 |
| 7.5457 | 2941 |
| 7.5488 | 2941.5 |
| 7.5519 | 2942.5 |
| 7.5534 | 2943 |
| 7.5567 | 2944 |
| 7.56 | 2945 |
| 7.5617 | 2945.9 |
| 7.5647 | 2946.9 |
| 7.5661 | 2947.4 |
| 7.5695 | 2948.9 |
| 7.5727 | 2949.9 |
| 7.5742 | 2950.4 |
| 7.5774 | 2951.3 |
| 7.5804 | 2952.3 |
| 7.5821 | 2952.8 |
| 7.5853 | 2953.8 |
| 7.5886 | 2954.8 |
| 7.5901 | 2955.8 |
| 7.5933 | 2956.2 |
| 7.5949 | 2956.7 |
| 7.5981 | 2957.7 |
| 7.6012 | 2958.7 |
| 7.6029 | 2958.7 |
| 7.6061 | 2959.7 |
| 7.6092 | 2960.2 |
| 7.6107 | 2960.2 |
| 7.6138 | 2960.7 |
| 7.6171 | 2960.7 |
| 7.6187 | 2960.7 |
| 7.6218 | 2960.7 |
| 7.6234 | 2960.2 |
| 7.6266 | 2959.7 |
| 7.6299 | 2958.7 |
| 7.6314 | 2958.2 |
| 7.6348 | 2956.7 |
| 7.6378 | 2955.3 |
| 7.6393 | 2954.8 |
| 7.6425 | 2953.8 |
| 7.6457 | 2952.8 |
| 7.6474 | 2952.3 |
| 7.6506 | 2951.8 |
| 7.6521 | 2951.3 |
| 7.6553 | 2950.8 |
| 7.6585 | 2950.8 |
| 7.66 | 2950.8 |
| 7.6632 | 2951.3 |
| 7.6663 | 2951.3 |
| 7.6679 | 2951.8 |
| 7.6712 | 2952.3 |
| 7.6744 | 2952.8 |
| 7.676 | 2953.3 |
| 7.6791 | 2953.8 |
| 7.6806 | 2954.3 |
| 7.6837 | 2954.8 |
| 7.687 | 2955.8 |
| 7.6887 | 2955.8 |
| 7.692 | 2956.7 |
| 7.6951 | 2957.7 |
| 7.6966 | 2958.7 |
| 7.6996 | 2959.7 |
| 7.7028 | 2960.7 |
| 7.7045 | 2961.6 |
| 7.7077 | 2962.6 |
| 7.7092 | 2963.1 |
| 7.7125 | 2964.6 |
| 7.7157 | 2965.6 |
| 7.7172 | 2966.1 |
| 7.7204 | 2967 |
| 7.7235 | 2968 |
| 7.7252 | 2968.5 |
| 7.7284 | 2969.5 |
| 7.7316 | 2970 |
| 7.7332 | 2970.5 |
| 7.7363 | 2971 |
| 7.7379 | 2971.4 |
| 7.7409 | 2971.4 |
| 7.7441 | 2971.9 |
| 7.7458 | 2971.9 |
| 7.7491 | 2971.4 |
| 7.7522 | 2971.4 |
| 7.7538 | 2971 |
| 7.7569 | 2970 |
| 7.7601 | 2969 |
| 7.7617 | 2968.5 |
| 7.765 | 2967.5 |
| 7.7666 | 2967 |
| 7.7697 | 2966.1 |
| 7.7729 | 2966.1 |
| 7.7746 | 2966.1 |
| 7.7778 | 2966.5 |
| 7.7809 | 2967.5 |
| 7.7824 | 2968.5 |
| 7.7855 | 2970 |
| 7.7887 | 2971.9 |
| 7.7904 | 2973.4 |
| 7.7936 | 2975.9 |
| 7.795 | 2976.8 |
| 7.7982 | 2979.3 |
| 7.8015 | 2981.3 |
| 7.8031 | 2982.2 |
| 7.8063 | 2983.2 |
| 7.8095 | 2984.2 |
| 7.8111 | 2984.2 |
| 7.8141 | 2984.2 |
| 7.8173 | 2984.2 |
| 7.8188 | 2984.2 |
| 7.8221 | 2984.2 |
| 7.8252 | 2983.7 |
| 7.8268 | 2984.2 |
| 7.83 | 2984.2 |
| 7.8315 | 2984.7 |
| 7.8347 | 2985.7 |
| 7.8379 | 2986.2 |
| 7.8395 | 2987.1 |
| 7.8426 | 2988.1 |
| 7.8459 | 2988.6 |
| 7.8474 | 2989.1 |
| 7.8506 | 2990.1 |
| 7.8537 | 2990.6 |
| 7.8553 | 2990.6 |
| 7.8585 | 2991.1 |
| 7.8602 | 2991.1 |
| 7.8635 | 2990.6 |
| 7.8667 | 2990.6 |
| 7.8682 | 2990.6 |
| 7.8712 | 2990.1 |
| 7.8743 | 2990.1 |
| 7.876 | 2990.1 |
| 7.8792 | 2990.1 |
| 7.8824 | 2990.1 |
| 7.8838 | 2990.1 |
| 7.887 | 2990.1 |
| 7.8902 | 2990.1 |
| 7.8919 | 2990.1 |
| 7.8951 | 2990.6 |
| 7.8965 | 2990.6 |
| 7.8996 | 2990.6 |
| 7.9029 | 2990.6 |
| 7.9046 | 2990.6 |
| 7.9078 | 2990.6 |
| 7.9109 | 2990.6 |
| 7.9124 | 2990.6 |
| 7.9154 | 2990.6 |
| 7.9187 | 2990.6 |
| 7.9204 | 2990.1 |
| 7.9236 | 2989.6 |
| 7.9251 | 2989.1 |
| 7.9283 | 2988.1 |
| 7.9315 | 2987.1 |
| 7.933 | 2986.7 |
| 7.9362 | 2985.2 |
| 7.9394 | 2983.7 |
| 7.9411 | 2983.2 |
| 7.9442 | 2981.7 |
| 7.9474 | 2980.3 |
| 7.949 | 2979.8 |
| 7.9521 | 2978.8 |
| 7.9538 | 2978.3 |
| 7.9568 | 2977.3 |
| 7.96 | 2976.8 |
| 7.9617 | 2976.8 |
| 7.9649 | 2976.4 |
| 7.968 | 2976.8 |
| 7.9695 | 2976.8 |
| 7.9726 | 2977.3 |
| 7.9758 | 2977.8 |
| 7.9776 | 2977.8 |
| 7.9808 | 2978.8 |
| 7.9823 | 2978.8 |
| 7.9855 | 2979.8 |
| 7.9886 | 2980.8 |
| 7.9901 | 2981.3 |
| 7.9934 | 2982.2 |
| 7.9967 | 2983.2 |
| 7.9983 | 2983.7 |
| 8.0013 | 2984.7 |
| 8.0045 | 2985.2 |
| 8.006 | 2985.7 |
| 8.0094 | 2985.7 |
| 8.0125 | 2986.2 |
| 8.014 | 2986.2 |
| 8.0171 | 2985.7 |
| 8.0188 | 2985.7 |
| 8.0221 | 2985.2 |
| 8.0253 | 2984.7 |
| 8.0267 | 2984.7 |
| 8.0297 | 2984.2 |
| 8.033 | 2983.7 |
| 8.0347 | 2983.7 |
| 8.038 | 2983.7 |
| 8.0411 | 2983.7 |
| 8.0426 | 2983.7 |
| 8.0456 | 2984.2 |
| 8.0473 | 2984.7 |
| 8.0505 | 2985.2 |
| 8.0537 | 2985.7 |
| 8.0552 | 2986.2 |
| 8.0583 | 2986.7 |
| 8.0617 | 2987.1 |
| 8.0632 | 2987.1 |
| 8.0664 | 2987.1 |
| 8.0695 | 2987.1 |
| 8.0712 | 2986.7 |
| 8.0743 | 2986.7 |
| 8.0759 | 2986.2 |
| 8.0791 | 2986.2 |
| 8.0824 | 2985.2 |
| 8.084 | 2985.2 |
| 8.087 | 2984.7 |
| 8.0901 | 2983.7 |
| 8.0918 | 2983.7 |
| 8.0951 | 2982.7 |
| 8.0983 | 2981.7 |
| 8.0997 | 2981.3 |
| 8.1027 | 2980.8 |
| 8.1044 | 2980.3 |
| 8.1077 | 2979.8 |
| 8.1109 | 2979.3 |
| 8.1126 | 2979.3 |
| 8.1157 | 2978.8 |
| 8.1188 | 2978.8 |
| 8.1204 | 2978.8 |
| 8.1236 | 2978.8 |
| 8.1267 | 2978.8 |
| 8.1284 | 2978.8 |
| 8.1315 | 2979.3 |
| 8.1331 | 2979.3 |
| 8.1365 | 2980.3 |
| 8.1396 | 2980.8 |
| 8.1411 | 2980.8 |
| 8.1441 | 2981.7 |
| 8.1473 | 2982.2 |
| 8.149 | 2982.7 |
| 8.1523 | 2983.2 |
| 8.1555 | 2983.7 |
| 8.1569 | 2984.2 |
| 8.16 | 2985.2 |
| 8.1616 | 2985.7 |
| 8.1648 | 2986.2 |
| 8.1681 | 2987.1 |
| 8.1698 | 2987.6 |
| 8.1729 | 2988.1 |
| 8.176 | 2989.1 |
| 8.1775 | 2989.1 |
| 8.1807 | 2990.1 |
| 8.1838 | 2990.6 |
| 8.1855 | 2990.6 |
| 8.1886 | 2991.6 |
| 8.1901 | 2991.6 |
| 8.1936 | 2992 |
| 8.1968 | 2992.5 |
| 8.1983 | 2993 |
| 8.2013 | 2993.5 |
| 8.2046 | 2994 |
| 8.2061 | 2994 |
| 8.2094 | 2994.5 |
| 8.2127 | 2995.5 |
| 8.2144 | 2995.5 |
| 8.2174 | 2996.5 |
| 8.2188 | 2997 |
| 8.2221 | 2997.4 |
| 8.2254 | 2998.9 |
| 8.2269 | 2999.4 |
| 8.23 | 3000.9 |
| 8.2331 | 3002.4 |
| 8.2348 | 3003.3 |
| 8.238 | 3005.3 |
| 8.2412 | 3007.3 |
| 8.2427 | 3008.7 |
| 8.2458 | 3010.7 |
| 8.2475 | 3012.2 |
| 8.2507 | 3014.1 |
| 8.254 | 3016.6 |
| 8.2556 | 3017.1 |
| 8.2587 | 3019 |
| 8.2617 | 3020.5 |
| 8.2633 | 3021 |
| 8.2665 | 3022 |
| 8.2698 | 3023 |
| 8.2715 | 3023 |
| 8.2745 | 3023 |
| 8.2776 | 3023 |
| 8.2791 | 3023 |
| 8.2824 | 3022.5 |
| 8.2841 | 3022.5 |
| 8.2873 | 3022 |
| 8.2903 | 3021 |
| 8.2919 | 3021 |
| 8.2951 | 3020.5 |
| 8.2983 | 3020 |
| 8.2999 | 3020 |
| 8.303 | 3019.5 |
| 8.3062 | 3019.5 |
| 8.3077 | 3019 |
| 8.3109 | 3019 |
| 8.3126 | 3018.5 |
| 8.3157 | 3018.5 |
| 8.3187 | 3018 |
| 8.3204 | 3017.6 |
| 8.3237 | 3017.6 |
| 8.3269 | 3017.1 |
| 8.3285 | 3016.6 |
| 8.3316 | 3016.1 |
| 8.3346 | 3015.6 |
| 8.3363 | 3015.6 |
| 8.3395 | 3015.6 |
| 8.3411 | 3015.1 |
| 8.3445 | 3015.1 |
| 8.3475 | 3015.1 |
| 8.349 | 3015.1 |
| 8.3522 | 3015.1 |
| 8.3553 | 3015.1 |
| 8.357 | 3015.1 |
| 8.3602 | 3015.1 |
| 8.3633 | 3015.1 |
| 8.3648 | 3015.1 |
| 8.3681 | 3015.1 |
| 8.3698 | 3015.1 |
| 8.3729 | 3014.6 |
| 8.3759 | 3014.1 |
| 8.3776 | 3013.6 |
| 8.3808 | 3013.1 |
| 8.3841 | 3012.7 |
| 8.3857 | 3012.2 |
| 8.3888 | 3011.2 |
| 8.3918 | 3010.7 |
| 8.3935 | 3010.2 |
| 8.3966 | 3009.7 |
| 8.3982 | 3009.7 |
| 8.4016 | 3009.2 |
| 8.4046 | 3008.7 |
| 8.4061 | 3008.7 |
| 8.4094 | 3008.7 |
| 8.4126 | 3008.2 |
| 8.4142 | 3008.2 |
| 8.4174 | 3008.2 |
| 8.4205 | 3007.7 |
| 8.422 | 3007.7 |
| 8.4255 | 3007.7 |
| 8.4287 | 3007.3 |
| 8.4302 | 3007.3 |
| 8.4332 | 3006.8 |
| 8.4348 | 3006.8 |
| 8.438 | 3006.3 |
| 8.4412 | 3005.8 |
| 8.4427 | 3005.3 |
| 8.4459 | 3004.8 |
| 8.449 | 3003.8 |
| 8.4506 | 3003.3 |
| 8.4538 | 3002.4 |
| 8.4571 | 3001.4 |
| 8.4586 | 3000.9 |
| 8.4617 | 2999.4 |
| 8.4633 | 2998.4 |
| 8.4665 | 2997 |
| 8.4698 | 2995.5 |
| 8.4713 | 2994.5 |
| 8.4746 | 2993 |
| 8.4777 | 2991.6 |
| 8.4792 | 2991.1 |
| 8.4824 | 2990.1 |
| 8.4856 | 2989.1 |
| 8.4873 | 2988.6 |
| 8.4903 | 2988.1 |
| 8.4917 | 2988.1 |
| 8.4951 | 2988.1 |
| 8.4984 | 2988.1 |
| 8.5 | 2988.1 |
| 8.5032 | 2988.1 |
| 8.5062 | 2988.6 |
| 8.5078 | 2988.6 |
| 8.511 | 2989.1 |
| 8.5142 | 2989.6 |
| 8.5158 | 2990.1 |
| 8.5189 | 2990.6 |
| 8.5205 | 2991.1 |
| 8.5237 | 2992 |
| 8.5269 | 2993 |
| 8.5285 | 2993.5 |
| 8.5317 | 2995 |
| 8.5348 | 2996 |
| 8.5363 | 2997 |
| 8.5395 | 2997.9 |
| 8.5428 | 2999.4 |
| 8.5444 | 2999.9 |
| 8.5476 | 3000.9 |
| 8.549 | 3001.4 |
| 8.5523 | 3002.4 |
| 8.5556 | 3002.8 |
| 8.5571 | 3002.8 |
| 8.5604 | 3002.8 |
| 8.5635 | 3002.8 |
| 8.565 | 3002.4 |
| 8.5682 | 3001.4 |
| 8.5713 | 3000.4 |
| 8.5729 | 2999.4 |
| 8.5761 | 2997.9 |
| 8.5777 | 2997.4 |
| 8.5808 | 2996 |
| 8.584 | 2995 |
| 8.5857 | 2994.5 |
| 8.5889 | 2993.5 |
| 8.592 | 2992.5 |
| 8.5934 | 2992.5 |
| 8.5967 | 2992 |
| 8.5999 | 2992 |
| 8.6016 | 2992 |
| 8.6048 | 2992 |
| 8.6064 | 2992 |
| 8.6094 | 2992.5 |
| 8.6127 | 2992.5 |
| 8.6144 | 2992.5 |
| 8.6176 | 2992.5 |
| 8.6207 | 2992.5 |
| 8.6221 | 2992.5 |
| 8.6253 | 2992.5 |
| 8.6285 | 2992.5 |
| 8.6302 | 2992.5 |
| 8.6334 | 2992.5 |
| 8.6349 | 2992.5 |
| 8.6382 | 2993 |
| 8.6414 | 2993 |
| 8.6429 | 2993.5 |
| 8.6461 | 2993.5 |
| 8.6492 | 2994 |
| 8.6508 | 2994 |
| 8.654 | 2994.5 |
| 8.6572 | 2994.5 |
| 8.6587 | 2995 |
| 8.6619 | 2995.5 |
| 8.6649 | 2995.5 |
| 8.6665 | 2996 |
| 8.6698 | 2996 |
| 8.6714 | 2996.5 |
| 8.6746 | 2996.5 |
| 8.6778 | 2996.5 |
| 8.6793 | 2996 |
| 8.6824 | 2996 |
| 8.6857 | 2995.5 |
| 8.6872 | 2995.5 |
| 8.6904 | 2995 |
| 8.6936 | 2994.5 |
| 8.6952 | 2994.5 |
| 8.6984 | 2994.5 |
| 8.6999 | 2994.5 |
| 8.7032 | 2995 |
| 8.7063 | 2995.5 |
| 8.7078 | 2996 |
| 8.7109 | 2996.5 |
| 8.7142 | 2997.4 |
| 8.7159 | 2997.9 |
| 8.7191 | 2998.9 |
| 8.7221 | 2999.4 |
| 8.7236 | 2999.9 |
| 8.7268 | 3000.9 |
| 8.7285 | 3001.4 |
| 8.7318 | 3001.9 |
| 8.735 | 3002.4 |
| 8.7366 | 3002.4 |
| 8.7396 | 3002.4 |
| 8.7428 | 3002.4 |
| 8.7445 | 3002.4 |
| 8.7477 | 3002.4 |
| 8.7509 | 3001.9 |
| 8.7523 | 3001.9 |
| 8.7555 | 3001.4 |
| 8.7572 | 3000.9 |
| 8.7604 | 2999.9 |
| 8.7635 | 2998.9 |
| 8.765 | 2997.9 |
| 8.7683 | 2997 |
| 8.7716 | 2995.5 |
| 8.7731 | 2994.5 |
| 8.7763 | 2993 |
| 8.7794 | 2992 |
| 8.781 | 2991.6 |
| 8.7841 | 2990.6 |
| 8.7857 | 2990.1 |
| 8.7889 | 2989.6 |
| 8.7921 | 2988.6 |
| 8.7937 | 2988.6 |
| 8.7967 | 2988.1 |
| 8.7999 | 2988.1 |
| 8.8016 | 2988.1 |
| 8.8049 | 2988.6 |
| 8.8081 | 2988.6 |
| 8.8095 | 2988.6 |
| 8.8127 | 2989.1 |
| 8.8144 | 2989.1 |
| 8.8176 | 2989.6 |
| 8.8208 | 2989.6 |
| 8.8223 | 2990.1 |
| 8.8255 | 2990.1 |
| 8.8287 | 2990.1 |
| 8.8302 | 2990.1 |
| 8.8334 | 2990.6 |
| 8.8366 | 2990.1 |
| 8.8382 | 2990.1 |
| 8.8412 | 2990.1 |
| 8.8445 | 2989.6 |
| 8.8461 | 2989.6 |
| 8.8493 | 2989.1 |
| 8.851 | 2988.6 |
| 8.854 | 2988.1 |
| 8.8571 | 2987.6 |
| 8.8586 | 2987.1 |
| 8.8619 | 2986.2 |
| 8.8651 | 2985.2 |
| 8.8668 | 2984.7 |
| 8.8698 | 2983.2 |
| 8.873 | 2982.2 |
| 8.8745 | 2981.3 |
| 8.8777 | 2980.3 |
| 8.8793 | 2979.8 |
| 8.8824 | 2978.8 |
| 8.8857 | 2978.3 |
| 8.8874 | 2977.8 |
| 8.8906 | 2977.8 |
| 8.8938 | 2977.3 |
| 8.8952 | 2977.3 |
| 8.8983 | 2977.3 |
| 8.9015 | 2977.8 |
| 8.9033 | 2977.8 |
| 8.9065 | 2977.8 |
| 8.9081 | 2977.8 |
| 8.9112 | 2977.3 |
| 8.9143 | 2976.8 |
| 8.9158 | 2976.8 |
| 8.919 | 2976.4 |
| 8.9222 | 2975.9 |
| 8.9239 | 2975.4 |
| 8.9269 | 2974.4 |
| 8.9302 | 2973.9 |
| 8.9317 | 2973.4 |
| 8.9349 | 2972.9 |
| 8.9366 | 2972.4 |
| 8.9396 | 2971.9 |
| 8.9428 | 2971.9 |
| 8.9445 | 2971.4 |
| 8.9478 | 2971.4 |
| 8.951 | 2971 |
| 8.9524 | 2970.5 |
| 8.9554 | 2970 |
| 8.9586 | 2969.5 |
| 8.9603 | 2969 |
| 8.9636 | 2968.5 |
| 8.9653 | 2968 |
| 8.9684 | 2967 |
| 8.9715 | 2966.1 |
| 8.9729 | 2965.1 |
| 8.9762 | 2964.1 |
| 8.9794 | 2962.6 |
| 8.9811 | 2961.6 |
| 8.9842 | 2960.7 |
| 8.9874 | 2959.2 |
| 8.9891 | 2958.7 |
| 8.9923 | 2957.2 |
| 8.9937 | 2956.7 |
| 8.9971 | 2955.8 |
| 9.0002 | 2954.8 |
| 9.0017 | 2954.3 |
| 9.0049 | 2953.3 |
| 9.0081 | 2952.3 |
| 9.0098 | 2951.8 |
| 9.0127 | 2950.8 |
| 9.0159 | 2949.9 |
| 9.0175 | 2949.4 |
| 9.0208 | 2948.4 |
| 9.024 | 2946.9 |
| 9.0256 | 2946.4 |
| 9.0286 | 2945.5 |
| 9.0301 | 2944.5 |
| 9.0334 | 2943.5 |
| 9.0366 | 2942 |
| 9.0383 | 2941.5 |
| 9.0414 | 2940.1 |
| 9.0445 | 2939.1 |
| 9.046 | 2938.6 |
| 9.0492 | 2937.1 |
| 9.0524 | 2936.1 |
| 9.054 | 2935.6 |
| 9.0571 | 2934.2 |
| 9.0588 | 2933.7 |
| 9.0621 | 2932.7 |
| 9.0653 | 2931.2 |
| 9.0668 | 2930.2 |
| 9.0698 | 2928.8 |
| 9.0729 | 2927.8 |
| 9.0746 | 2926.8 |
| 9.0779 | 2925.3 |
| 9.0812 | 2923.9 |
| 9.0827 | 2922.9 |
| 9.0857 | 2921.4 |
| 9.0873 | 2920.4 |
| 9.0904 | 2919 |
| 9.0937 | 2917.5 |
| 9.0954 | 2916.5 |
| 9.0985 | 2915 |
| 9.1017 | 2913.6 |
| 9.1032 | 2912.6 |
| 9.1064 | 2910.6 |
| 9.1096 | 2909.2 |
| 9.1112 | 2908.2 |
| 9.1143 | 2906.7 |
| 9.1176 | 2904.7 |
| 9.1191 | 2903.8 |
| 9.1223 | 2901.8 |
| 9.124 | 2900.8 |
| 9.1271 | 2899.3 |
| 9.1301 | 2897.4 |
| 9.1316 | 2896.4 |
| 9.1349 | 2894.4 |
| 9.1381 | 2892.5 |
| 9.1398 | 2891.5 |
| 9.1428 | 2889.5 |
| 9.1459 | 2887.6 |
| 9.1476 | 2886.6 |
| 9.1509 | 2884.1 |
| 9.1524 | 2883.2 |
| 9.1556 | 2881.2 |
| 9.1587 | 2878.7 |
| 9.1604 | 2877.8 |
| 9.1636 | 2875.3 |
| 9.1668 | 2873.3 |
| 9.1683 | 2871.9 |
| 9.1714 | 2869.9 |
| 9.1745 | 2867.5 |
| 9.1762 | 2866 |
| 9.1795 | 2863.5 |
| 9.1826 | 2861.1 |
| 9.1841 | 2859.6 |
| 9.1871 | 2857.2 |
| 9.1888 | 2855.7 |
| 9.192 | 2853.2 |
| 9.1953 | 2850.3 |
| 9.1968 | 2848.8 |
| 9.1999 | 2846.4 |
| 9.203 | 2843.4 |
| 9.2046 | 2842.4 |
| 9.2079 | 2839.5 |
| 9.2111 | 2836.6 |
| 9.2128 | 2835.1 |
| 9.2159 | 2832.1 |
| 9.2174 | 2830.7 |
| 9.2205 | 2827.7 |
| 9.2237 | 2824.8 |
| 9.2253 | 2823.3 |
| 9.2285 | 2819.9 |
| 9.2316 | 2816.9 |
| 9.2332 | 2815 |
| 9.2364 | 2811.5 |
| 9.2396 | 2808.1 |
| 9.2413 | 2806.6 |
| 9.2443 | 2803.2 |
| 9.2458 | 2801.2 |
| 9.2492 | 2797.8 |
| 9.2525 | 2794.4 |
| 9.2542 | 2792.4 |
| 9.2581 | 2788.5 |
| 9.2608 | 2785.1 |
| 9.2623 | 2685.5 |
| 9.2653 | 2418.2 |
| 9.2684 | 2108.2 |